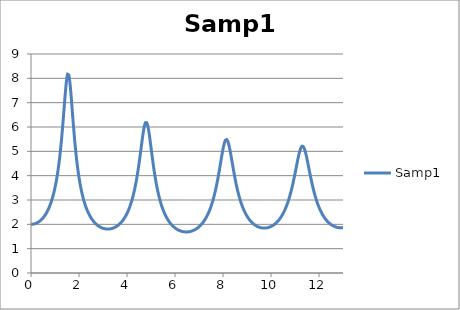
| Category | Samp1 |
|---|---|
| 0.0 | 2 |
| 0.0122 | 2 |
| 0.0244 | 2.001 |
| 0.0366 | 2.001 |
| 0.0488 | 2.002 |
| 0.061 | 2.003 |
| 0.0732 | 2.005 |
| 0.0854 | 2.007 |
| 0.0977 | 2.009 |
| 0.1099 | 2.011 |
| 0.1221 | 2.014 |
| 0.1343 | 2.017 |
| 0.1465 | 2.02 |
| 0.1587 | 2.024 |
| 0.1709 | 2.028 |
| 0.1831 | 2.032 |
| 0.1953 | 2.037 |
| 0.2075 | 2.042 |
| 0.2197 | 2.047 |
| 0.2319 | 2.052 |
| 0.2441 | 2.058 |
| 0.2563 | 2.064 |
| 0.2686 | 2.071 |
| 0.2808 | 2.077 |
| 0.293 | 2.084 |
| 0.3052 | 2.092 |
| 0.3174 | 2.1 |
| 0.3296 | 2.108 |
| 0.3418 | 2.116 |
| 0.354 | 2.125 |
| 0.3662 | 2.135 |
| 0.3784 | 2.144 |
| 0.3906 | 2.154 |
| 0.4028 | 2.165 |
| 0.415 | 2.176 |
| 0.4272 | 2.187 |
| 0.4395 | 2.199 |
| 0.4517 | 2.211 |
| 0.4639 | 2.224 |
| 0.4761 | 2.237 |
| 0.4883 | 2.25 |
| 0.5005 | 2.264 |
| 0.5127 | 2.279 |
| 0.5249 | 2.294 |
| 0.5371 | 2.309 |
| 0.5493 | 2.325 |
| 0.5615 | 2.342 |
| 0.5737 | 2.359 |
| 0.5859 | 2.377 |
| 0.5981 | 2.395 |
| 0.6104 | 2.414 |
| 0.6226 | 2.434 |
| 0.6348 | 2.454 |
| 0.647 | 2.475 |
| 0.6592 | 2.496 |
| 0.6714 | 2.519 |
| 0.6836 | 2.542 |
| 0.6958 | 2.565 |
| 0.708 | 2.59 |
| 0.7202 | 2.615 |
| 0.7324 | 2.642 |
| 0.7446 | 2.669 |
| 0.7568 | 2.697 |
| 0.769 | 2.726 |
| 0.7813 | 2.756 |
| 0.7935 | 2.787 |
| 0.8057 | 2.819 |
| 0.8179 | 2.852 |
| 0.8301 | 2.886 |
| 0.8423 | 2.921 |
| 0.8545 | 2.958 |
| 0.8667 | 2.996 |
| 0.8789 | 3.035 |
| 0.8911 | 3.076 |
| 0.9033 | 3.118 |
| 0.9155 | 3.161 |
| 0.9277 | 3.206 |
| 0.9399 | 3.253 |
| 0.9521 | 3.301 |
| 0.9644 | 3.351 |
| 0.9766 | 3.403 |
| 0.9888 | 3.457 |
| 1.001 | 3.513 |
| 1.0132 | 3.571 |
| 1.0254 | 3.631 |
| 1.0376 | 3.693 |
| 1.0498 | 3.758 |
| 1.062 | 3.825 |
| 1.0742 | 3.895 |
| 1.0864 | 3.968 |
| 1.0986 | 4.043 |
| 1.1108 | 4.122 |
| 1.123 | 4.203 |
| 1.1353 | 4.288 |
| 1.1475 | 4.376 |
| 1.1597 | 4.467 |
| 1.1719 | 4.562 |
| 1.1841 | 4.661 |
| 1.1963 | 4.764 |
| 1.2085 | 4.87 |
| 1.2207 | 4.981 |
| 1.2329 | 5.095 |
| 1.2451 | 5.214 |
| 1.2573 | 5.337 |
| 1.2695 | 5.464 |
| 1.2817 | 5.596 |
| 1.2939 | 5.732 |
| 1.3062 | 5.871 |
| 1.3184 | 6.014 |
| 1.3306 | 6.161 |
| 1.3428 | 6.311 |
| 1.355 | 6.463 |
| 1.3672 | 6.616 |
| 1.3794 | 6.771 |
| 1.3916 | 6.926 |
| 1.4038 | 7.079 |
| 1.416 | 7.229 |
| 1.4282 | 7.375 |
| 1.4404 | 7.515 |
| 1.4526 | 7.648 |
| 1.4648 | 7.77 |
| 1.4771 | 7.88 |
| 1.4893 | 7.977 |
| 1.5015 | 8.057 |
| 1.5137 | 8.12 |
| 1.5259 | 8.165 |
| 1.5381 | 8.189 |
| 1.5503 | 8.192 |
| 1.5625 | 8.175 |
| 1.5747 | 8.138 |
| 1.5869 | 8.081 |
| 1.5991 | 8.006 |
| 1.6113 | 7.915 |
| 1.6235 | 7.808 |
| 1.6357 | 7.688 |
| 1.6479 | 7.558 |
| 1.6602 | 7.418 |
| 1.6724 | 7.271 |
| 1.6846 | 7.12 |
| 1.6968 | 6.965 |
| 1.709 | 6.808 |
| 1.7212 | 6.65 |
| 1.7334 | 6.493 |
| 1.7456 | 6.337 |
| 1.7578 | 6.183 |
| 1.77 | 6.032 |
| 1.7822 | 5.885 |
| 1.7944 | 5.741 |
| 1.8066 | 5.601 |
| 1.8188 | 5.465 |
| 1.8311 | 5.334 |
| 1.8433 | 5.207 |
| 1.8555 | 5.084 |
| 1.8677 | 4.965 |
| 1.8799 | 4.851 |
| 1.8921 | 4.741 |
| 1.9043 | 4.635 |
| 1.9165 | 4.533 |
| 1.9287 | 4.434 |
| 1.9409 | 4.34 |
| 1.9531 | 4.249 |
| 1.9653 | 4.161 |
| 1.9775 | 4.077 |
| 1.9897 | 3.996 |
| 2.002 | 3.918 |
| 2.0142 | 3.843 |
| 2.0264 | 3.771 |
| 2.0386 | 3.701 |
| 2.0508 | 3.634 |
| 2.063 | 3.569 |
| 2.0752 | 3.507 |
| 2.0874 | 3.447 |
| 2.0996 | 3.389 |
| 2.1118 | 3.334 |
| 2.124 | 3.28 |
| 2.1362 | 3.228 |
| 2.1484 | 3.178 |
| 2.1606 | 3.13 |
| 2.1729 | 3.083 |
| 2.1851 | 3.038 |
| 2.1973 | 2.995 |
| 2.2095 | 2.953 |
| 2.2217 | 2.912 |
| 2.2339 | 2.873 |
| 2.2461 | 2.835 |
| 2.2583 | 2.798 |
| 2.2705 | 2.762 |
| 2.2827 | 2.728 |
| 2.2949 | 2.695 |
| 2.3071 | 2.662 |
| 2.3193 | 2.631 |
| 2.3315 | 2.601 |
| 2.3438 | 2.572 |
| 2.356 | 2.543 |
| 2.3682 | 2.516 |
| 2.3804 | 2.489 |
| 2.3926 | 2.464 |
| 2.4048 | 2.439 |
| 2.417 | 2.414 |
| 2.4292 | 2.391 |
| 2.4414 | 2.368 |
| 2.4536 | 2.346 |
| 2.4658 | 2.325 |
| 2.478 | 2.304 |
| 2.4902 | 2.284 |
| 2.5024 | 2.265 |
| 2.5146 | 2.246 |
| 2.5269 | 2.227 |
| 2.5391 | 2.21 |
| 2.5513 | 2.192 |
| 2.5635 | 2.176 |
| 2.5757 | 2.159 |
| 2.5879 | 2.144 |
| 2.6001 | 2.129 |
| 2.6123 | 2.114 |
| 2.6245 | 2.1 |
| 2.6367 | 2.086 |
| 2.6489 | 2.072 |
| 2.6611 | 2.059 |
| 2.6733 | 2.047 |
| 2.6855 | 2.035 |
| 2.6978 | 2.023 |
| 2.71 | 2.012 |
| 2.7222 | 2.001 |
| 2.7344 | 1.99 |
| 2.7466 | 1.98 |
| 2.7588 | 1.97 |
| 2.771 | 1.96 |
| 2.7832 | 1.951 |
| 2.7954 | 1.942 |
| 2.8076 | 1.934 |
| 2.8198 | 1.925 |
| 2.832 | 1.917 |
| 2.8442 | 1.91 |
| 2.8564 | 1.902 |
| 2.8687 | 1.895 |
| 2.8809 | 1.889 |
| 2.8931 | 1.882 |
| 2.9053 | 1.876 |
| 2.9175 | 1.87 |
| 2.9297 | 1.865 |
| 2.9419 | 1.859 |
| 2.9541 | 1.854 |
| 2.9663 | 1.849 |
| 2.9785 | 1.845 |
| 2.9907 | 1.841 |
| 3.0029 | 1.837 |
| 3.0151 | 1.833 |
| 3.0273 | 1.829 |
| 3.0396 | 1.826 |
| 3.0518 | 1.823 |
| 3.064 | 1.82 |
| 3.0762 | 1.818 |
| 3.0884 | 1.816 |
| 3.1006 | 1.814 |
| 3.1128 | 1.812 |
| 3.125 | 1.81 |
| 3.1372 | 1.809 |
| 3.1494 | 1.808 |
| 3.1616 | 1.807 |
| 3.1738 | 1.806 |
| 3.186 | 1.806 |
| 3.1982 | 1.806 |
| 3.2104 | 1.806 |
| 3.2227 | 1.806 |
| 3.2349 | 1.807 |
| 3.2471 | 1.808 |
| 3.2593 | 1.809 |
| 3.2715 | 1.81 |
| 3.2837 | 1.811 |
| 3.2959 | 1.813 |
| 3.3081 | 1.815 |
| 3.3203 | 1.817 |
| 3.3325 | 1.82 |
| 3.3447 | 1.823 |
| 3.3569 | 1.826 |
| 3.3691 | 1.829 |
| 3.3813 | 1.832 |
| 3.3936 | 1.836 |
| 3.4058 | 1.84 |
| 3.418 | 1.844 |
| 3.4302 | 1.849 |
| 3.4424 | 1.853 |
| 3.4546 | 1.859 |
| 3.4668 | 1.864 |
| 3.479 | 1.869 |
| 3.4912 | 1.875 |
| 3.5034 | 1.881 |
| 3.5156 | 1.888 |
| 3.5278 | 1.894 |
| 3.54 | 1.901 |
| 3.5522 | 1.909 |
| 3.5645 | 1.916 |
| 3.5767 | 1.924 |
| 3.5889 | 1.932 |
| 3.6011 | 1.941 |
| 3.6133 | 1.95 |
| 3.6255 | 1.959 |
| 3.6377 | 1.968 |
| 3.6499 | 1.978 |
| 3.6621 | 1.988 |
| 3.6743 | 1.999 |
| 3.6865 | 2.01 |
| 3.6987 | 2.021 |
| 3.7109 | 2.033 |
| 3.7231 | 2.045 |
| 3.7354 | 2.057 |
| 3.7476 | 2.07 |
| 3.7598 | 2.083 |
| 3.772 | 2.097 |
| 3.7842 | 2.111 |
| 3.7964 | 2.126 |
| 3.8086 | 2.141 |
| 3.8208 | 2.156 |
| 3.833 | 2.172 |
| 3.8452 | 2.189 |
| 3.8574 | 2.206 |
| 3.8696 | 2.224 |
| 3.8818 | 2.242 |
| 3.894 | 2.26 |
| 3.9063 | 2.28 |
| 3.9185 | 2.3 |
| 3.9307 | 2.32 |
| 3.9429 | 2.341 |
| 3.9551 | 2.363 |
| 3.9673 | 2.385 |
| 3.9795 | 2.408 |
| 3.9917 | 2.432 |
| 4.0039 | 2.457 |
| 4.0161 | 2.482 |
| 4.0283 | 2.508 |
| 4.0405 | 2.535 |
| 4.0527 | 2.563 |
| 4.0649 | 2.592 |
| 4.0771 | 2.621 |
| 4.0894 | 2.651 |
| 4.1016 | 2.683 |
| 4.1138 | 2.715 |
| 4.126 | 2.749 |
| 4.1382 | 2.783 |
| 4.1504 | 2.819 |
| 4.1626 | 2.855 |
| 4.1748 | 2.893 |
| 4.187 | 2.932 |
| 4.1992 | 2.973 |
| 4.2114 | 3.014 |
| 4.2236 | 3.057 |
| 4.2358 | 3.102 |
| 4.248 | 3.147 |
| 4.2603 | 3.195 |
| 4.2725 | 3.243 |
| 4.2847 | 3.294 |
| 4.2969 | 3.346 |
| 4.3091 | 3.399 |
| 4.3213 | 3.455 |
| 4.3335 | 3.512 |
| 4.3457 | 3.571 |
| 4.3579 | 3.632 |
| 4.3701 | 3.695 |
| 4.3823 | 3.76 |
| 4.3945 | 3.826 |
| 4.4067 | 3.895 |
| 4.4189 | 3.966 |
| 4.4312 | 4.039 |
| 4.4434 | 4.114 |
| 4.4556 | 4.191 |
| 4.4678 | 4.27 |
| 4.48 | 4.351 |
| 4.4922 | 4.434 |
| 4.5044 | 4.518 |
| 4.5166 | 4.605 |
| 4.5288 | 4.693 |
| 4.541 | 4.783 |
| 4.5532 | 4.873 |
| 4.5654 | 4.965 |
| 4.5776 | 5.057 |
| 4.5898 | 5.15 |
| 4.6021 | 5.242 |
| 4.6143 | 5.334 |
| 4.6265 | 5.425 |
| 4.6387 | 5.514 |
| 4.6509 | 5.601 |
| 4.6631 | 5.685 |
| 4.6753 | 5.765 |
| 4.6875 | 5.84 |
| 4.6997 | 5.911 |
| 4.7119 | 5.975 |
| 4.7241 | 6.032 |
| 4.7363 | 6.082 |
| 4.7485 | 6.124 |
| 4.7607 | 6.157 |
| 4.7729 | 6.18 |
| 4.7852 | 6.195 |
| 4.7974 | 6.199 |
| 4.8096 | 6.193 |
| 4.8218 | 6.178 |
| 4.834 | 6.153 |
| 4.8462 | 6.119 |
| 4.8584 | 6.075 |
| 4.8706 | 6.024 |
| 4.8828 | 5.965 |
| 4.895 | 5.9 |
| 4.9072 | 5.828 |
| 4.9194 | 5.751 |
| 4.9316 | 5.669 |
| 4.9438 | 5.584 |
| 4.9561 | 5.496 |
| 4.9683 | 5.405 |
| 4.9805 | 5.313 |
| 4.9927 | 5.22 |
| 5.0049 | 5.126 |
| 5.0171 | 5.032 |
| 5.0293 | 4.938 |
| 5.0415 | 4.845 |
| 5.0537 | 4.753 |
| 5.0659 | 4.662 |
| 5.0781 | 4.572 |
| 5.0903 | 4.485 |
| 5.1025 | 4.399 |
| 5.1147 | 4.314 |
| 5.127 | 4.232 |
| 5.1392 | 4.152 |
| 5.1514 | 4.074 |
| 5.1636 | 3.998 |
| 5.1758 | 3.924 |
| 5.188 | 3.853 |
| 5.2002 | 3.783 |
| 5.2124 | 3.715 |
| 5.2246 | 3.649 |
| 5.2368 | 3.586 |
| 5.249 | 3.524 |
| 5.2612 | 3.464 |
| 5.2734 | 3.406 |
| 5.2856 | 3.35 |
| 5.2979 | 3.296 |
| 5.3101 | 3.243 |
| 5.3223 | 3.192 |
| 5.3345 | 3.142 |
| 5.3467 | 3.094 |
| 5.3589 | 3.048 |
| 5.3711 | 3.003 |
| 5.3833 | 2.959 |
| 5.3955 | 2.917 |
| 5.4077 | 2.876 |
| 5.4199 | 2.837 |
| 5.4321 | 2.798 |
| 5.4443 | 2.761 |
| 5.4565 | 2.725 |
| 5.4688 | 2.69 |
| 5.481 | 2.656 |
| 5.4932 | 2.623 |
| 5.5054 | 2.591 |
| 5.5176 | 2.56 |
| 5.5298 | 2.53 |
| 5.542 | 2.501 |
| 5.5542 | 2.472 |
| 5.5664 | 2.445 |
| 5.5786 | 2.418 |
| 5.5908 | 2.393 |
| 5.603 | 2.367 |
| 5.6152 | 2.343 |
| 5.6274 | 2.319 |
| 5.6396 | 2.297 |
| 5.6519 | 2.274 |
| 5.6641 | 2.253 |
| 5.6763 | 2.232 |
| 5.6885 | 2.211 |
| 5.7007 | 2.191 |
| 5.7129 | 2.172 |
| 5.7251 | 2.154 |
| 5.7373 | 2.135 |
| 5.7495 | 2.118 |
| 5.7617 | 2.101 |
| 5.7739 | 2.084 |
| 5.7861 | 2.068 |
| 5.7983 | 2.052 |
| 5.8105 | 2.037 |
| 5.8228 | 2.022 |
| 5.835 | 2.008 |
| 5.8472 | 1.994 |
| 5.8594 | 1.981 |
| 5.8716 | 1.968 |
| 5.8838 | 1.955 |
| 5.896 | 1.943 |
| 5.9082 | 1.931 |
| 5.9204 | 1.919 |
| 5.9326 | 1.908 |
| 5.9448 | 1.897 |
| 5.957 | 1.887 |
| 5.9692 | 1.877 |
| 5.9814 | 1.867 |
| 5.9937 | 1.857 |
| 6.0059 | 1.848 |
| 6.0181 | 1.839 |
| 6.0303 | 1.831 |
| 6.0425 | 1.822 |
| 6.0547 | 1.814 |
| 6.0669 | 1.807 |
| 6.0791 | 1.799 |
| 6.0913 | 1.792 |
| 6.1035 | 1.785 |
| 6.1157 | 1.778 |
| 6.1279 | 1.772 |
| 6.1401 | 1.766 |
| 6.1523 | 1.76 |
| 6.1646 | 1.754 |
| 6.1768 | 1.749 |
| 6.189 | 1.744 |
| 6.2012 | 1.739 |
| 6.2134 | 1.734 |
| 6.2256 | 1.73 |
| 6.2378 | 1.726 |
| 6.25 | 1.722 |
| 6.2622 | 1.718 |
| 6.2744 | 1.714 |
| 6.2866 | 1.711 |
| 6.2988 | 1.708 |
| 6.311 | 1.705 |
| 6.3232 | 1.703 |
| 6.3354 | 1.7 |
| 6.3477 | 1.698 |
| 6.3599 | 1.696 |
| 6.3721 | 1.694 |
| 6.3843 | 1.693 |
| 6.3965 | 1.691 |
| 6.4087 | 1.69 |
| 6.4209 | 1.689 |
| 6.4331 | 1.688 |
| 6.4453 | 1.688 |
| 6.4575 | 1.688 |
| 6.4697 | 1.687 |
| 6.4819 | 1.687 |
| 6.4941 | 1.688 |
| 6.5063 | 1.688 |
| 6.5186 | 1.689 |
| 6.5308 | 1.69 |
| 6.543 | 1.691 |
| 6.5552 | 1.692 |
| 6.5674 | 1.694 |
| 6.5796 | 1.696 |
| 6.5918 | 1.698 |
| 6.604 | 1.7 |
| 6.6162 | 1.702 |
| 6.6284 | 1.705 |
| 6.6406 | 1.707 |
| 6.6528 | 1.71 |
| 6.665 | 1.714 |
| 6.6772 | 1.717 |
| 6.6895 | 1.721 |
| 6.7017 | 1.725 |
| 6.7139 | 1.729 |
| 6.7261 | 1.733 |
| 6.7383 | 1.738 |
| 6.7505 | 1.743 |
| 6.7627 | 1.748 |
| 6.7749 | 1.753 |
| 6.7871 | 1.759 |
| 6.7993 | 1.764 |
| 6.8115 | 1.77 |
| 6.8237 | 1.777 |
| 6.8359 | 1.783 |
| 6.8481 | 1.79 |
| 6.8604 | 1.797 |
| 6.8726 | 1.804 |
| 6.8848 | 1.812 |
| 6.897 | 1.82 |
| 6.9092 | 1.828 |
| 6.9214 | 1.836 |
| 6.9336 | 1.845 |
| 6.9458 | 1.854 |
| 6.958 | 1.864 |
| 6.9702 | 1.873 |
| 6.9824 | 1.883 |
| 6.9946 | 1.893 |
| 7.0068 | 1.904 |
| 7.019 | 1.915 |
| 7.0312 | 1.926 |
| 7.0435 | 1.938 |
| 7.0557 | 1.95 |
| 7.0679 | 1.962 |
| 7.0801 | 1.975 |
| 7.0923 | 1.988 |
| 7.1045 | 2.002 |
| 7.1167 | 2.016 |
| 7.1289 | 2.03 |
| 7.1411 | 2.045 |
| 7.1533 | 2.06 |
| 7.1655 | 2.076 |
| 7.1777 | 2.092 |
| 7.1899 | 2.108 |
| 7.2021 | 2.125 |
| 7.2144 | 2.143 |
| 7.2266 | 2.161 |
| 7.2388 | 2.18 |
| 7.251 | 2.199 |
| 7.2632 | 2.218 |
| 7.2754 | 2.239 |
| 7.2876 | 2.259 |
| 7.2998 | 2.281 |
| 7.312 | 2.303 |
| 7.3242 | 2.325 |
| 7.3364 | 2.349 |
| 7.3486 | 2.373 |
| 7.3608 | 2.397 |
| 7.373 | 2.423 |
| 7.3853 | 2.449 |
| 7.3975 | 2.476 |
| 7.4097 | 2.504 |
| 7.4219 | 2.532 |
| 7.4341 | 2.561 |
| 7.4463 | 2.591 |
| 7.4585 | 2.622 |
| 7.4707 | 2.654 |
| 7.4829 | 2.687 |
| 7.4951 | 2.721 |
| 7.5073 | 2.756 |
| 7.5195 | 2.792 |
| 7.5317 | 2.828 |
| 7.5439 | 2.866 |
| 7.5562 | 2.905 |
| 7.5684 | 2.946 |
| 7.5806 | 2.987 |
| 7.5928 | 3.029 |
| 7.605 | 3.073 |
| 7.6172 | 3.118 |
| 7.6294 | 3.164 |
| 7.6416 | 3.212 |
| 7.6538 | 3.261 |
| 7.666 | 3.311 |
| 7.6782 | 3.363 |
| 7.6904 | 3.416 |
| 7.7026 | 3.47 |
| 7.7148 | 3.526 |
| 7.7271 | 3.584 |
| 7.7393 | 3.642 |
| 7.7515 | 3.702 |
| 7.7637 | 3.764 |
| 7.7759 | 3.827 |
| 7.7881 | 3.891 |
| 7.8003 | 3.957 |
| 7.8125 | 4.024 |
| 7.8247 | 4.092 |
| 7.8369 | 4.161 |
| 7.8491 | 4.231 |
| 7.8613 | 4.302 |
| 7.8735 | 4.373 |
| 7.8857 | 4.445 |
| 7.8979 | 4.517 |
| 7.9102 | 4.59 |
| 7.9224 | 4.662 |
| 7.9346 | 4.733 |
| 7.9468 | 4.804 |
| 7.959 | 4.874 |
| 7.9712 | 4.941 |
| 7.9834 | 5.007 |
| 7.9956 | 5.071 |
| 8.0078 | 5.132 |
| 8.02 | 5.189 |
| 8.0322 | 5.242 |
| 8.0444 | 5.292 |
| 8.0566 | 5.336 |
| 8.0688 | 5.376 |
| 8.0811 | 5.41 |
| 8.0933 | 5.438 |
| 8.1055 | 5.46 |
| 8.1177 | 5.476 |
| 8.1299 | 5.485 |
| 8.1421 | 5.488 |
| 8.1543 | 5.484 |
| 8.1665 | 5.473 |
| 8.1787 | 5.456 |
| 8.1909 | 5.433 |
| 8.2031 | 5.403 |
| 8.2153 | 5.368 |
| 8.2275 | 5.328 |
| 8.2397 | 5.283 |
| 8.252 | 5.234 |
| 8.2642 | 5.18 |
| 8.2764 | 5.123 |
| 8.2886 | 5.063 |
| 8.3008 | 5 |
| 8.313 | 4.935 |
| 8.3252 | 4.868 |
| 8.3374 | 4.8 |
| 8.3496 | 4.731 |
| 8.3618 | 4.661 |
| 8.374 | 4.591 |
| 8.3862 | 4.52 |
| 8.3984 | 4.45 |
| 8.4106 | 4.38 |
| 8.4229 | 4.31 |
| 8.4351 | 4.241 |
| 8.4473 | 4.174 |
| 8.4595 | 4.107 |
| 8.4717 | 4.041 |
| 8.4839 | 3.976 |
| 8.4961 | 3.913 |
| 8.5083 | 3.85 |
| 8.5205 | 3.79 |
| 8.5327 | 3.73 |
| 8.5449 | 3.672 |
| 8.5571 | 3.615 |
| 8.5693 | 3.56 |
| 8.5815 | 3.506 |
| 8.5938 | 3.453 |
| 8.606 | 3.402 |
| 8.6182 | 3.352 |
| 8.6304 | 3.304 |
| 8.6426 | 3.257 |
| 8.6548 | 3.211 |
| 8.667 | 3.166 |
| 8.6792 | 3.123 |
| 8.6914 | 3.081 |
| 8.7036 | 3.04 |
| 8.7158 | 3 |
| 8.728 | 2.961 |
| 8.7402 | 2.924 |
| 8.7524 | 2.887 |
| 8.7646 | 2.852 |
| 8.7769 | 2.817 |
| 8.7891 | 2.784 |
| 8.8013 | 2.751 |
| 8.8135 | 2.72 |
| 8.8257 | 2.689 |
| 8.8379 | 2.66 |
| 8.8501 | 2.631 |
| 8.8623 | 2.602 |
| 8.8745 | 2.575 |
| 8.8867 | 2.549 |
| 8.8989 | 2.523 |
| 8.9111 | 2.498 |
| 8.9233 | 2.474 |
| 8.9355 | 2.45 |
| 8.9478 | 2.427 |
| 8.96 | 2.405 |
| 8.9722 | 2.383 |
| 8.9844 | 2.362 |
| 8.9966 | 2.342 |
| 9.0088 | 2.322 |
| 9.021 | 2.303 |
| 9.0332 | 2.285 |
| 9.0454 | 2.266 |
| 9.0576 | 2.249 |
| 9.0698 | 2.232 |
| 9.082 | 2.215 |
| 9.0942 | 2.199 |
| 9.1064 | 2.184 |
| 9.1187 | 2.169 |
| 9.1309 | 2.154 |
| 9.1431 | 2.14 |
| 9.1553 | 2.126 |
| 9.1675 | 2.113 |
| 9.1797 | 2.1 |
| 9.1919 | 2.087 |
| 9.2041 | 2.075 |
| 9.2163 | 2.063 |
| 9.2285 | 2.052 |
| 9.2407 | 2.041 |
| 9.2529 | 2.03 |
| 9.2651 | 2.02 |
| 9.2773 | 2.01 |
| 9.2896 | 2 |
| 9.3018 | 1.991 |
| 9.314 | 1.982 |
| 9.3262 | 1.974 |
| 9.3384 | 1.965 |
| 9.3506 | 1.958 |
| 9.3628 | 1.95 |
| 9.375 | 1.943 |
| 9.3872 | 1.935 |
| 9.3994 | 1.929 |
| 9.4116 | 1.922 |
| 9.4238 | 1.916 |
| 9.436 | 1.91 |
| 9.4482 | 1.905 |
| 9.4604 | 1.899 |
| 9.4727 | 1.894 |
| 9.4849 | 1.889 |
| 9.4971 | 1.885 |
| 9.5093 | 1.88 |
| 9.5215 | 1.876 |
| 9.5337 | 1.873 |
| 9.5459 | 1.869 |
| 9.5581 | 1.866 |
| 9.5703 | 1.863 |
| 9.5825 | 1.86 |
| 9.5947 | 1.858 |
| 9.6069 | 1.855 |
| 9.6191 | 1.853 |
| 9.6313 | 1.851 |
| 9.6436 | 1.85 |
| 9.6558 | 1.849 |
| 9.668 | 1.847 |
| 9.6802 | 1.847 |
| 9.6924 | 1.846 |
| 9.7046 | 1.846 |
| 9.7168 | 1.845 |
| 9.729 | 1.846 |
| 9.7412 | 1.846 |
| 9.7534 | 1.846 |
| 9.7656 | 1.847 |
| 9.7778 | 1.848 |
| 9.79 | 1.85 |
| 9.8022 | 1.851 |
| 9.8145 | 1.853 |
| 9.8267 | 1.855 |
| 9.8389 | 1.857 |
| 9.8511 | 1.86 |
| 9.8633 | 1.862 |
| 9.8755 | 1.865 |
| 9.8877 | 1.869 |
| 9.8999 | 1.872 |
| 9.9121 | 1.876 |
| 9.9243 | 1.88 |
| 9.9365 | 1.884 |
| 9.9487 | 1.888 |
| 9.9609 | 1.893 |
| 9.9731 | 1.898 |
| 9.9854 | 1.904 |
| 9.9976 | 1.909 |
| 10.0098 | 1.915 |
| 10.022 | 1.921 |
| 10.0342 | 1.927 |
| 10.0464 | 1.934 |
| 10.0586 | 1.941 |
| 10.0708 | 1.948 |
| 10.083 | 1.956 |
| 10.0952 | 1.963 |
| 10.1074 | 1.972 |
| 10.1196 | 1.98 |
| 10.1318 | 1.989 |
| 10.144 | 1.998 |
| 10.1563 | 2.007 |
| 10.1685 | 2.017 |
| 10.1807 | 2.027 |
| 10.1929 | 2.037 |
| 10.2051 | 2.048 |
| 10.2173 | 2.059 |
| 10.2295 | 2.071 |
| 10.2417 | 2.083 |
| 10.2539 | 2.095 |
| 10.2661 | 2.107 |
| 10.2783 | 2.12 |
| 10.2905 | 2.134 |
| 10.3027 | 2.148 |
| 10.3149 | 2.162 |
| 10.3271 | 2.177 |
| 10.3394 | 2.192 |
| 10.3516 | 2.207 |
| 10.3638 | 2.223 |
| 10.376 | 2.24 |
| 10.3882 | 2.257 |
| 10.4004 | 2.274 |
| 10.4126 | 2.292 |
| 10.4248 | 2.311 |
| 10.437 | 2.33 |
| 10.4492 | 2.349 |
| 10.4614 | 2.37 |
| 10.4736 | 2.39 |
| 10.4858 | 2.412 |
| 10.498 | 2.434 |
| 10.5103 | 2.456 |
| 10.5225 | 2.48 |
| 10.5347 | 2.503 |
| 10.5469 | 2.528 |
| 10.5591 | 2.553 |
| 10.5713 | 2.579 |
| 10.5835 | 2.606 |
| 10.5957 | 2.633 |
| 10.6079 | 2.662 |
| 10.6201 | 2.691 |
| 10.6323 | 2.72 |
| 10.6445 | 2.751 |
| 10.6567 | 2.782 |
| 10.6689 | 2.815 |
| 10.6812 | 2.848 |
| 10.6934 | 2.882 |
| 10.7056 | 2.917 |
| 10.7178 | 2.953 |
| 10.73 | 2.99 |
| 10.7422 | 3.029 |
| 10.7544 | 3.068 |
| 10.7666 | 3.108 |
| 10.7788 | 3.149 |
| 10.791 | 3.191 |
| 10.8032 | 3.234 |
| 10.8154 | 3.279 |
| 10.8276 | 3.324 |
| 10.8398 | 3.371 |
| 10.8521 | 3.419 |
| 10.8643 | 3.468 |
| 10.8765 | 3.518 |
| 10.8887 | 3.569 |
| 10.9009 | 3.621 |
| 10.9131 | 3.675 |
| 10.9253 | 3.729 |
| 10.9375 | 3.785 |
| 10.9497 | 3.841 |
| 10.9619 | 3.899 |
| 10.9741 | 3.957 |
| 10.9863 | 4.016 |
| 10.9985 | 4.076 |
| 11.0107 | 4.136 |
| 11.0229 | 4.197 |
| 11.0352 | 4.258 |
| 11.0474 | 4.32 |
| 11.0596 | 4.381 |
| 11.0718 | 4.442 |
| 11.084 | 4.503 |
| 11.0962 | 4.564 |
| 11.1084 | 4.623 |
| 11.1206 | 4.682 |
| 11.1328 | 4.739 |
| 11.145 | 4.794 |
| 11.1572 | 4.847 |
| 11.1694 | 4.898 |
| 11.1816 | 4.946 |
| 11.1938 | 4.991 |
| 11.2061 | 5.033 |
| 11.2183 | 5.072 |
| 11.2305 | 5.106 |
| 11.2427 | 5.136 |
| 11.2549 | 5.162 |
| 11.2671 | 5.182 |
| 11.2793 | 5.198 |
| 11.2915 | 5.209 |
| 11.3037 | 5.215 |
| 11.3159 | 5.215 |
| 11.3281 | 5.211 |
| 11.3403 | 5.201 |
| 11.3525 | 5.186 |
| 11.3647 | 5.166 |
| 11.377 | 5.141 |
| 11.3892 | 5.112 |
| 11.4014 | 5.078 |
| 11.4136 | 5.041 |
| 11.4258 | 4.999 |
| 11.438 | 4.955 |
| 11.4502 | 4.907 |
| 11.4624 | 4.857 |
| 11.4746 | 4.804 |
| 11.4868 | 4.749 |
| 11.499 | 4.693 |
| 11.5112 | 4.635 |
| 11.5234 | 4.576 |
| 11.5356 | 4.516 |
| 11.5479 | 4.455 |
| 11.5601 | 4.394 |
| 11.5723 | 4.333 |
| 11.5845 | 4.271 |
| 11.5967 | 4.21 |
| 11.6089 | 4.15 |
| 11.6211 | 4.089 |
| 11.6333 | 4.03 |
| 11.6455 | 3.971 |
| 11.6577 | 3.912 |
| 11.6699 | 3.855 |
| 11.6821 | 3.799 |
| 11.6943 | 3.743 |
| 11.7065 | 3.689 |
| 11.7188 | 3.635 |
| 11.731 | 3.583 |
| 11.7432 | 3.532 |
| 11.7554 | 3.482 |
| 11.7676 | 3.433 |
| 11.7798 | 3.385 |
| 11.792 | 3.338 |
| 11.8042 | 3.293 |
| 11.8164 | 3.248 |
| 11.8286 | 3.205 |
| 11.8408 | 3.163 |
| 11.853 | 3.121 |
| 11.8652 | 3.081 |
| 11.8774 | 3.042 |
| 11.8896 | 3.004 |
| 11.9019 | 2.967 |
| 11.9141 | 2.931 |
| 11.9263 | 2.896 |
| 11.9385 | 2.861 |
| 11.9507 | 2.828 |
| 11.9629 | 2.796 |
| 11.9751 | 2.764 |
| 11.9873 | 2.734 |
| 11.9995 | 2.704 |
| 12.0117 | 2.675 |
| 12.0239 | 2.646 |
| 12.0361 | 2.619 |
| 12.0483 | 2.592 |
| 12.0605 | 2.566 |
| 12.0728 | 2.541 |
| 12.085 | 2.516 |
| 12.0972 | 2.493 |
| 12.1094 | 2.469 |
| 12.1216 | 2.447 |
| 12.1338 | 2.425 |
| 12.146 | 2.403 |
| 12.1582 | 2.383 |
| 12.1704 | 2.362 |
| 12.1826 | 2.343 |
| 12.1948 | 2.324 |
| 12.207 | 2.305 |
| 12.2192 | 2.287 |
| 12.2314 | 2.27 |
| 12.2437 | 2.253 |
| 12.2559 | 2.236 |
| 12.2681 | 2.22 |
| 12.2803 | 2.205 |
| 12.2925 | 2.189 |
| 12.3047 | 2.175 |
| 12.3169 | 2.161 |
| 12.3291 | 2.147 |
| 12.3413 | 2.133 |
| 12.3535 | 2.12 |
| 12.3657 | 2.108 |
| 12.3779 | 2.095 |
| 12.3901 | 2.084 |
| 12.4023 | 2.072 |
| 12.4145 | 2.061 |
| 12.4268 | 2.05 |
| 12.439 | 2.04 |
| 12.4512 | 2.03 |
| 12.4634 | 2.02 |
| 12.4756 | 2.011 |
| 12.4878 | 2.002 |
| 12.5 | 1.993 |
| 12.5122 | 1.985 |
| 12.5244 | 1.976 |
| 12.5366 | 1.969 |
| 12.5488 | 1.961 |
| 12.561 | 1.954 |
| 12.5732 | 1.947 |
| 12.5854 | 1.94 |
| 12.5977 | 1.934 |
| 12.6099 | 1.928 |
| 12.6221 | 1.922 |
| 12.6343 | 1.917 |
| 12.6465 | 1.911 |
| 12.6587 | 1.906 |
| 12.6709 | 1.902 |
| 12.6831 | 1.897 |
| 12.6953 | 1.893 |
| 12.7075 | 1.889 |
| 12.7197 | 1.885 |
| 12.7319 | 1.882 |
| 12.7441 | 1.879 |
| 12.7563 | 1.876 |
| 12.7686 | 1.873 |
| 12.7808 | 1.87 |
| 12.793 | 1.868 |
| 12.8052 | 1.866 |
| 12.8174 | 1.864 |
| 12.8296 | 1.863 |
| 12.8418 | 1.862 |
| 12.854 | 1.861 |
| 12.8662 | 1.86 |
| 12.8784 | 1.859 |
| 12.8906 | 1.859 |
| 12.9028 | 1.859 |
| 12.915 | 1.859 |
| 12.9272 | 1.859 |
| 12.9395 | 1.86 |
| 12.9517 | 1.861 |
| 12.9639 | 1.862 |
| 12.9761 | 1.863 |
| 12.9883 | 1.864 |
| 13.0005 | 1.866 |
| 13.0127 | 1.868 |
| 13.0249 | 1.87 |
| 13.0371 | 1.873 |
| 13.0493 | 1.876 |
| 13.0615 | 1.879 |
| 13.0737 | 1.882 |
| 13.0859 | 1.885 |
| 13.0981 | 1.889 |
| 13.1104 | 1.893 |
| 13.1226 | 1.897 |
| 13.1348 | 1.902 |
| 13.147 | 1.906 |
| 13.1592 | 1.911 |
| 13.1714 | 1.917 |
| 13.1836 | 1.922 |
| 13.1958 | 1.928 |
| 13.208 | 1.934 |
| 13.2202 | 1.94 |
| 13.2324 | 1.947 |
| 13.2446 | 1.954 |
| 13.2568 | 1.961 |
| 13.269 | 1.968 |
| 13.2813 | 1.976 |
| 13.2935 | 1.984 |
| 13.3057 | 1.992 |
| 13.3179 | 2.001 |
| 13.3301 | 2.01 |
| 13.3423 | 2.019 |
| 13.3545 | 2.029 |
| 13.3667 | 2.039 |
| 13.3789 | 2.049 |
| 13.3911 | 2.06 |
| 13.4033 | 2.071 |
| 13.4155 | 2.082 |
| 13.4277 | 2.093 |
| 13.4399 | 2.105 |
| 13.4521 | 2.118 |
| 13.4644 | 2.131 |
| 13.4766 | 2.144 |
| 13.4888 | 2.157 |
| 13.501 | 2.171 |
| 13.5132 | 2.186 |
| 13.5254 | 2.2 |
| 13.5376 | 2.216 |
| 13.5498 | 2.231 |
| 13.562 | 2.247 |
| 13.5742 | 2.264 |
| 13.5864 | 2.281 |
| 13.5986 | 2.298 |
| 13.6108 | 2.316 |
| 13.623 | 2.335 |
| 13.6353 | 2.354 |
| 13.6475 | 2.373 |
| 13.6597 | 2.393 |
| 13.6719 | 2.413 |
| 13.6841 | 2.435 |
| 13.6963 | 2.456 |
| 13.7085 | 2.478 |
| 13.7207 | 2.501 |
| 13.7329 | 2.524 |
| 13.7451 | 2.548 |
| 13.7573 | 2.573 |
| 13.7695 | 2.598 |
| 13.7817 | 2.624 |
| 13.7939 | 2.65 |
| 13.8062 | 2.678 |
| 13.8184 | 2.705 |
| 13.8306 | 2.734 |
| 13.8428 | 2.763 |
| 13.855 | 2.793 |
| 13.8672 | 2.824 |
| 13.8794 | 2.855 |
| 13.8916 | 2.887 |
| 13.9038 | 2.919 |
| 13.916 | 2.953 |
| 13.9282 | 2.987 |
| 13.9404 | 3.022 |
| 13.9526 | 3.057 |
| 13.9648 | 3.094 |
| 13.9771 | 3.131 |
| 13.9893 | 3.168 |
| 14.0015 | 3.207 |
| 14.0137 | 3.246 |
| 14.0259 | 3.285 |
| 14.0381 | 3.326 |
| 14.0503 | 3.367 |
| 14.0625 | 3.408 |
| 14.0747 | 3.45 |
| 14.0869 | 3.492 |
| 14.0991 | 3.535 |
| 14.1113 | 3.578 |
| 14.1235 | 3.621 |
| 14.1357 | 3.664 |
| 14.1479 | 3.708 |
| 14.1602 | 3.751 |
| 14.1724 | 3.794 |
| 14.1846 | 3.837 |
| 14.1968 | 3.88 |
| 14.209 | 3.922 |
| 14.2212 | 3.963 |
| 14.2334 | 4.004 |
| 14.2456 | 4.043 |
| 14.2578 | 4.081 |
| 14.27 | 4.118 |
| 14.2822 | 4.154 |
| 14.2944 | 4.188 |
| 14.3066 | 4.219 |
| 14.3188 | 4.249 |
| 14.3311 | 4.277 |
| 14.3433 | 4.302 |
| 14.3555 | 4.324 |
| 14.3677 | 4.344 |
| 14.3799 | 4.361 |
| 14.3921 | 4.375 |
| 14.4043 | 4.385 |
| 14.4165 | 4.393 |
| 14.4287 | 4.397 |
| 14.4409 | 4.398 |
| 14.4531 | 4.396 |
| 14.4653 | 4.39 |
| 14.4775 | 4.381 |
| 14.4897 | 4.369 |
| 14.502 | 4.353 |
| 14.5142 | 4.335 |
| 14.5264 | 4.314 |
| 14.5386 | 4.289 |
| 14.5508 | 4.263 |
| 14.563 | 4.233 |
| 14.5752 | 4.202 |
| 14.5874 | 4.168 |
| 14.5996 | 4.133 |
| 14.6118 | 4.095 |
| 14.624 | 4.056 |
| 14.6362 | 4.016 |
| 14.6484 | 3.974 |
| 14.6606 | 3.932 |
| 14.6729 | 3.888 |
| 14.6851 | 3.844 |
| 14.6973 | 3.8 |
| 14.7095 | 3.755 |
| 14.7217 | 3.709 |
| 14.7339 | 3.664 |
| 14.7461 | 3.618 |
| 14.7583 | 3.573 |
| 14.7705 | 3.527 |
| 14.7827 | 3.482 |
| 14.7949 | 3.438 |
| 14.8071 | 3.393 |
| 14.8193 | 3.349 |
| 14.8315 | 3.306 |
| 14.8438 | 3.263 |
| 14.856 | 3.221 |
| 14.8682 | 3.179 |
| 14.8804 | 3.139 |
| 14.8926 | 3.098 |
| 14.9048 | 3.059 |
| 14.917 | 3.02 |
| 14.9292 | 2.982 |
| 14.9414 | 2.944 |
| 14.9536 | 2.908 |
| 14.9658 | 2.872 |
| 14.978 | 2.837 |
| 14.9902 | 2.802 |
| 15.0024 | 2.769 |
| 15.0146 | 2.736 |
| 15.0269 | 2.704 |
| 15.0391 | 2.672 |
| 15.0513 | 2.642 |
| 15.0635 | 2.612 |
| 15.0757 | 2.582 |
| 15.0879 | 2.554 |
| 15.1001 | 2.526 |
| 15.1123 | 2.498 |
| 15.1245 | 2.472 |
| 15.1367 | 2.446 |
| 15.1489 | 2.42 |
| 15.1611 | 2.396 |
| 15.1733 | 2.371 |
| 15.1855 | 2.348 |
| 15.1978 | 2.325 |
| 15.21 | 2.303 |
| 15.2222 | 2.281 |
| 15.2344 | 2.259 |
| 15.2466 | 2.239 |
| 15.2588 | 2.218 |
| 15.271 | 2.199 |
| 15.2832 | 2.179 |
| 15.2954 | 2.161 |
| 15.3076 | 2.142 |
| 15.3198 | 2.124 |
| 15.332 | 2.107 |
| 15.3442 | 2.09 |
| 15.3564 | 2.074 |
| 15.3687 | 2.058 |
| 15.3809 | 2.042 |
| 15.3931 | 2.027 |
| 15.4053 | 2.012 |
| 15.4175 | 1.997 |
| 15.4297 | 1.983 |
| 15.4419 | 1.97 |
| 15.4541 | 1.956 |
| 15.4663 | 1.943 |
| 15.4785 | 1.931 |
| 15.4907 | 1.918 |
| 15.5029 | 1.906 |
| 15.5151 | 1.895 |
| 15.5273 | 1.883 |
| 15.5396 | 1.872 |
| 15.5518 | 1.862 |
| 15.564 | 1.851 |
| 15.5762 | 1.841 |
| 15.5884 | 1.832 |
| 15.6006 | 1.822 |
| 15.6128 | 1.813 |
| 15.625 | 1.804 |
| 15.6372 | 1.795 |
| 15.6494 | 1.787 |
| 15.6616 | 1.779 |
| 15.6738 | 1.771 |
| 15.686 | 1.763 |
| 15.6982 | 1.756 |
| 15.7104 | 1.749 |
| 15.7227 | 1.742 |
| 15.7349 | 1.735 |
| 15.7471 | 1.729 |
| 15.7593 | 1.723 |
| 15.7715 | 1.717 |
| 15.7837 | 1.711 |
| 15.7959 | 1.705 |
| 15.8081 | 1.7 |
| 15.8203 | 1.695 |
| 15.8325 | 1.69 |
| 15.8447 | 1.686 |
| 15.8569 | 1.681 |
| 15.8691 | 1.677 |
| 15.8813 | 1.673 |
| 15.8936 | 1.669 |
| 15.9058 | 1.665 |
| 15.918 | 1.662 |
| 15.9302 | 1.659 |
| 15.9424 | 1.656 |
| 15.9546 | 1.653 |
| 15.9668 | 1.65 |
| 15.979 | 1.648 |
| 15.9912 | 1.646 |
| 16.0034 | 1.644 |
| 16.0156 | 1.642 |
| 16.0278 | 1.64 |
| 16.04 | 1.639 |
| 16.0522 | 1.637 |
| 16.0645 | 1.636 |
| 16.0767 | 1.635 |
| 16.0889 | 1.634 |
| 16.1011 | 1.634 |
| 16.1133 | 1.634 |
| 16.1255 | 1.633 |
| 16.1377 | 1.633 |
| 16.1499 | 1.634 |
| 16.1621 | 1.634 |
| 16.1743 | 1.634 |
| 16.1865 | 1.635 |
| 16.1987 | 1.636 |
| 16.2109 | 1.637 |
| 16.2231 | 1.638 |
| 16.2354 | 1.64 |
| 16.2476 | 1.642 |
| 16.2598 | 1.643 |
| 16.272 | 1.645 |
| 16.2842 | 1.648 |
| 16.2964 | 1.65 |
| 16.3086 | 1.653 |
| 16.3208 | 1.655 |
| 16.333 | 1.658 |
| 16.3452 | 1.662 |
| 16.3574 | 1.665 |
| 16.3696 | 1.668 |
| 16.3818 | 1.672 |
| 16.394 | 1.676 |
| 16.4063 | 1.68 |
| 16.4185 | 1.685 |
| 16.4307 | 1.689 |
| 16.4429 | 1.694 |
| 16.4551 | 1.699 |
| 16.4673 | 1.704 |
| 16.4795 | 1.71 |
| 16.4917 | 1.715 |
| 16.5039 | 1.721 |
| 16.5161 | 1.727 |
| 16.5283 | 1.734 |
| 16.5405 | 1.74 |
| 16.5527 | 1.747 |
| 16.5649 | 1.754 |
| 16.5771 | 1.761 |
| 16.5894 | 1.769 |
| 16.6016 | 1.776 |
| 16.6138 | 1.784 |
| 16.626 | 1.793 |
| 16.6382 | 1.801 |
| 16.6504 | 1.81 |
| 16.6626 | 1.819 |
| 16.6748 | 1.828 |
| 16.687 | 1.838 |
| 16.6992 | 1.848 |
| 16.7114 | 1.858 |
| 16.7236 | 1.868 |
| 16.7358 | 1.879 |
| 16.748 | 1.89 |
| 16.7603 | 1.901 |
| 16.7725 | 1.913 |
| 16.7847 | 1.925 |
| 16.7969 | 1.937 |
| 16.8091 | 1.95 |
| 16.8213 | 1.963 |
| 16.8335 | 1.976 |
| 16.8457 | 1.989 |
| 16.8579 | 2.003 |
| 16.8701 | 2.018 |
| 16.8823 | 2.032 |
| 16.8945 | 2.047 |
| 16.9067 | 2.063 |
| 16.9189 | 2.078 |
| 16.9312 | 2.095 |
| 16.9434 | 2.111 |
| 16.9556 | 2.128 |
| 16.9678 | 2.146 |
| 16.98 | 2.163 |
| 16.9922 | 2.182 |
| 17.0044 | 2.2 |
| 17.0166 | 2.219 |
| 17.0288 | 2.239 |
| 17.041 | 2.259 |
| 17.0532 | 2.279 |
| 17.0654 | 2.3 |
| 17.0776 | 2.321 |
| 17.0898 | 2.343 |
| 17.1021 | 2.366 |
| 17.1143 | 2.388 |
| 17.1265 | 2.412 |
| 17.1387 | 2.435 |
| 17.1509 | 2.46 |
| 17.1631 | 2.484 |
| 17.1753 | 2.51 |
| 17.1875 | 2.535 |
| 17.1997 | 2.561 |
| 17.2119 | 2.588 |
| 17.2241 | 2.615 |
| 17.2363 | 2.643 |
| 17.2485 | 2.671 |
| 17.2607 | 2.7 |
| 17.2729 | 2.729 |
| 17.2852 | 2.758 |
| 17.2974 | 2.788 |
| 17.3096 | 2.819 |
| 17.3218 | 2.849 |
| 17.334 | 2.88 |
| 17.3462 | 2.912 |
| 17.3584 | 2.944 |
| 17.3706 | 2.976 |
| 17.3828 | 3.008 |
| 17.395 | 3.04 |
| 17.4072 | 3.073 |
| 17.4194 | 3.106 |
| 17.4316 | 3.138 |
| 17.4438 | 3.171 |
| 17.4561 | 3.204 |
| 17.4683 | 3.236 |
| 17.4805 | 3.268 |
| 17.4927 | 3.3 |
| 17.5049 | 3.332 |
| 17.5171 | 3.363 |
| 17.5293 | 3.393 |
| 17.5415 | 3.423 |
| 17.5537 | 3.452 |
| 17.5659 | 3.48 |
| 17.5781 | 3.508 |
| 17.5903 | 3.534 |
| 17.6025 | 3.559 |
| 17.6147 | 3.582 |
| 17.627 | 3.605 |
| 17.6392 | 3.625 |
| 17.6514 | 3.644 |
| 17.6636 | 3.662 |
| 17.6758 | 3.677 |
| 17.688 | 3.691 |
| 17.7002 | 3.703 |
| 17.7124 | 3.712 |
| 17.7246 | 3.72 |
| 17.7368 | 3.726 |
| 17.749 | 3.729 |
| 17.7612 | 3.73 |
| 17.7734 | 3.729 |
| 17.7856 | 3.726 |
| 17.7979 | 3.721 |
| 17.8101 | 3.714 |
| 17.8223 | 3.704 |
| 17.8345 | 3.693 |
| 17.8467 | 3.679 |
| 17.8589 | 3.664 |
| 17.8711 | 3.647 |
| 17.8833 | 3.628 |
| 17.8955 | 3.607 |
| 17.9077 | 3.585 |
| 17.9199 | 3.562 |
| 17.9321 | 3.537 |
| 17.9443 | 3.511 |
| 17.9565 | 3.484 |
| 17.9688 | 3.456 |
| 17.981 | 3.427 |
| 17.9932 | 3.397 |
| 18.0054 | 3.367 |
| 18.0176 | 3.336 |
| 18.0298 | 3.304 |
| 18.042 | 3.272 |
| 18.0542 | 3.24 |
| 18.0664 | 3.207 |
| 18.0786 | 3.175 |
| 18.0908 | 3.142 |
| 18.103 | 3.109 |
| 18.1152 | 3.077 |
| 18.1274 | 3.044 |
| 18.1396 | 3.011 |
| 18.1519 | 2.979 |
| 18.1641 | 2.947 |
| 18.1763 | 2.915 |
| 18.1885 | 2.884 |
| 18.2007 | 2.853 |
| 18.2129 | 2.822 |
| 18.2251 | 2.791 |
| 18.2373 | 2.761 |
| 18.2495 | 2.732 |
| 18.2617 | 2.703 |
| 18.2739 | 2.674 |
| 18.2861 | 2.646 |
| 18.2983 | 2.618 |
| 18.3105 | 2.591 |
| 18.3228 | 2.564 |
| 18.335 | 2.538 |
| 18.3472 | 2.512 |
| 18.3594 | 2.486 |
| 18.3716 | 2.462 |
| 18.3838 | 2.437 |
| 18.396 | 2.413 |
| 18.4082 | 2.39 |
| 18.4204 | 2.367 |
| 18.4326 | 2.345 |
| 18.4448 | 2.323 |
| 18.457 | 2.301 |
| 18.4692 | 2.28 |
| 18.4814 | 2.26 |
| 18.4937 | 2.24 |
| 18.5059 | 2.22 |
| 18.5181 | 2.201 |
| 18.5303 | 2.182 |
| 18.5425 | 2.164 |
| 18.5547 | 2.146 |
| 18.5669 | 2.129 |
| 18.5791 | 2.112 |
| 18.5913 | 2.095 |
| 18.6035 | 2.079 |
| 18.6157 | 2.063 |
| 18.6279 | 2.047 |
| 18.6401 | 2.032 |
| 18.6523 | 2.017 |
| 18.6646 | 2.003 |
| 18.6768 | 1.989 |
| 18.689 | 1.975 |
| 18.7012 | 1.962 |
| 18.7134 | 1.949 |
| 18.7256 | 1.936 |
| 18.7378 | 1.924 |
| 18.75 | 1.912 |
| 18.7622 | 1.9 |
| 18.7744 | 1.889 |
| 18.7866 | 1.878 |
| 18.7988 | 1.867 |
| 18.811 | 1.856 |
| 18.8232 | 1.846 |
| 18.8354 | 1.836 |
| 18.8477 | 1.827 |
| 18.8599 | 1.817 |
| 18.8721 | 1.808 |
| 18.8843 | 1.799 |
| 18.8965 | 1.791 |
| 18.9087 | 1.782 |
| 18.9209 | 1.774 |
| 18.9331 | 1.766 |
| 18.9453 | 1.759 |
| 18.9575 | 1.751 |
| 18.9697 | 1.744 |
| 18.9819 | 1.737 |
| 18.9941 | 1.731 |
| 19.0063 | 1.724 |
| 19.0186 | 1.718 |
| 19.0308 | 1.712 |
| 19.043 | 1.706 |
| 19.0552 | 1.701 |
| 19.0674 | 1.695 |
| 19.0796 | 1.69 |
| 19.0918 | 1.685 |
| 19.104 | 1.681 |
| 19.1162 | 1.676 |
| 19.1284 | 1.672 |
| 19.1406 | 1.668 |
| 19.1528 | 1.664 |
| 19.165 | 1.66 |
| 19.1772 | 1.657 |
| 19.1895 | 1.653 |
| 19.2017 | 1.65 |
| 19.2139 | 1.647 |
| 19.2261 | 1.645 |
| 19.2383 | 1.642 |
| 19.2505 | 1.64 |
| 19.2627 | 1.637 |
| 19.2749 | 1.635 |
| 19.2871 | 1.634 |
| 19.2993 | 1.632 |
| 19.3115 | 1.631 |
| 19.3237 | 1.629 |
| 19.3359 | 1.628 |
| 19.3481 | 1.627 |
| 19.3604 | 1.626 |
| 19.3726 | 1.626 |
| 19.3848 | 1.626 |
| 19.397 | 1.625 |
| 19.4092 | 1.625 |
| 19.4214 | 1.625 |
| 19.4336 | 1.626 |
| 19.4458 | 1.626 |
| 19.458 | 1.627 |
| 19.4702 | 1.628 |
| 19.4824 | 1.629 |
| 19.4946 | 1.63 |
| 19.5068 | 1.631 |
| 19.519 | 1.633 |
| 19.5313 | 1.635 |
| 19.5435 | 1.637 |
| 19.5557 | 1.639 |
| 19.5679 | 1.641 |
| 19.5801 | 1.644 |
| 19.5923 | 1.646 |
| 19.6045 | 1.649 |
| 19.6167 | 1.652 |
| 19.6289 | 1.655 |
| 19.6411 | 1.659 |
| 19.6533 | 1.662 |
| 19.6655 | 1.666 |
| 19.6777 | 1.67 |
| 19.6899 | 1.674 |
| 19.7021 | 1.679 |
| 19.7144 | 1.683 |
| 19.7266 | 1.688 |
| 19.7388 | 1.693 |
| 19.751 | 1.698 |
| 19.7632 | 1.704 |
| 19.7754 | 1.709 |
| 19.7876 | 1.715 |
| 19.7998 | 1.721 |
| 19.812 | 1.728 |
| 19.8242 | 1.734 |
| 19.8364 | 1.741 |
| 19.8486 | 1.748 |
| 19.8608 | 1.755 |
| 19.873 | 1.762 |
| 19.8853 | 1.77 |
| 19.8975 | 1.778 |
| 19.9097 | 1.786 |
| 19.9219 | 1.794 |
| 19.9341 | 1.803 |
| 19.9463 | 1.812 |
| 19.9585 | 1.821 |
| 19.9707 | 1.83 |
| 19.9829 | 1.84 |
| 19.9951 | 1.85 |
| 20.0073 | 1.86 |
| 20.0195 | 1.87 |
| 20.0317 | 1.881 |
| 20.0439 | 1.892 |
| 20.0562 | 1.903 |
| 20.0684 | 1.915 |
| 20.0806 | 1.927 |
| 20.0928 | 1.939 |
| 20.105 | 1.952 |
| 20.1172 | 1.964 |
| 20.1294 | 1.978 |
| 20.1416 | 1.991 |
| 20.1538 | 2.005 |
| 20.166 | 2.019 |
| 20.1782 | 2.034 |
| 20.1904 | 2.048 |
| 20.2026 | 2.064 |
| 20.2148 | 2.079 |
| 20.2271 | 2.095 |
| 20.2393 | 2.111 |
| 20.2515 | 2.128 |
| 20.2637 | 2.145 |
| 20.2759 | 2.162 |
| 20.2881 | 2.18 |
| 20.3003 | 2.198 |
| 20.3125 | 2.217 |
| 20.3247 | 2.236 |
| 20.3369 | 2.255 |
| 20.3491 | 2.275 |
| 20.3613 | 2.295 |
| 20.3735 | 2.316 |
| 20.3857 | 2.337 |
| 20.3979 | 2.358 |
| 20.4102 | 2.38 |
| 20.4224 | 2.402 |
| 20.4346 | 2.425 |
| 20.4468 | 2.448 |
| 20.459 | 2.472 |
| 20.4712 | 2.496 |
| 20.4834 | 2.52 |
| 20.4956 | 2.545 |
| 20.5078 | 2.57 |
| 20.52 | 2.596 |
| 20.5322 | 2.622 |
| 20.5444 | 2.648 |
| 20.5566 | 2.675 |
| 20.5688 | 2.702 |
| 20.5811 | 2.73 |
| 20.5933 | 2.758 |
| 20.6055 | 2.786 |
| 20.6177 | 2.814 |
| 20.6299 | 2.843 |
| 20.6421 | 2.872 |
| 20.6543 | 2.901 |
| 20.6665 | 2.931 |
| 20.6787 | 2.96 |
| 20.6909 | 2.99 |
| 20.7031 | 3.019 |
| 20.7153 | 3.049 |
| 20.7275 | 3.078 |
| 20.7397 | 3.108 |
| 20.752 | 3.137 |
| 20.7642 | 3.166 |
| 20.7764 | 3.195 |
| 20.7886 | 3.223 |
| 20.8008 | 3.251 |
| 20.813 | 3.279 |
| 20.8252 | 3.306 |
| 20.8374 | 3.332 |
| 20.8496 | 3.358 |
| 20.8618 | 3.383 |
| 20.874 | 3.406 |
| 20.8862 | 3.429 |
| 20.8984 | 3.451 |
| 20.9106 | 3.472 |
| 20.9229 | 3.491 |
| 20.9351 | 3.509 |
| 20.9473 | 3.526 |
| 20.9595 | 3.541 |
| 20.9717 | 3.555 |
| 20.9839 | 3.567 |
| 20.9961 | 3.578 |
| 21.0083 | 3.587 |
| 21.0205 | 3.594 |
| 21.0327 | 3.599 |
| 21.0449 | 3.603 |
| 21.0571 | 3.605 |
| 21.0693 | 3.605 |
| 21.0815 | 3.603 |
| 21.0938 | 3.599 |
| 21.106 | 3.594 |
| 21.1182 | 3.587 |
| 21.1304 | 3.578 |
| 21.1426 | 3.567 |
| 21.1548 | 3.555 |
| 21.167 | 3.542 |
| 21.1792 | 3.527 |
| 21.1914 | 3.51 |
| 21.2036 | 3.493 |
| 21.2158 | 3.474 |
| 21.228 | 3.453 |
| 21.2402 | 3.432 |
| 21.2524 | 3.41 |
| 21.2646 | 3.387 |
| 21.2769 | 3.363 |
| 21.2891 | 3.338 |
| 21.3013 | 3.312 |
| 21.3135 | 3.286 |
| 21.3257 | 3.26 |
| 21.3379 | 3.233 |
| 21.3501 | 3.205 |
| 21.3623 | 3.178 |
| 21.3745 | 3.15 |
| 21.3867 | 3.122 |
| 21.3989 | 3.093 |
| 21.4111 | 3.065 |
| 21.4233 | 3.037 |
| 21.4355 | 3.008 |
| 21.4478 | 2.98 |
| 21.46 | 2.952 |
| 21.4722 | 2.924 |
| 21.4844 | 2.896 |
| 21.4966 | 2.869 |
| 21.5088 | 2.841 |
| 21.521 | 2.814 |
| 21.5332 | 2.788 |
| 21.5454 | 2.761 |
| 21.5576 | 2.735 |
| 21.5698 | 2.709 |
| 21.582 | 2.684 |
| 21.5942 | 2.659 |
| 21.6064 | 2.634 |
| 21.6187 | 2.61 |
| 21.6309 | 2.586 |
| 21.6431 | 2.562 |
| 21.6553 | 2.539 |
| 21.6675 | 2.516 |
| 21.6797 | 2.494 |
| 21.6919 | 2.472 |
| 21.7041 | 2.451 |
| 21.7163 | 2.43 |
| 21.7285 | 2.409 |
| 21.7407 | 2.389 |
| 21.7529 | 2.369 |
| 21.7651 | 2.35 |
| 21.7773 | 2.331 |
| 21.7896 | 2.312 |
| 21.8018 | 2.294 |
| 21.814 | 2.276 |
| 21.8262 | 2.259 |
| 21.8384 | 2.242 |
| 21.8506 | 2.225 |
| 21.8628 | 2.209 |
| 21.875 | 2.193 |
| 21.8872 | 2.178 |
| 21.8994 | 2.163 |
| 21.9116 | 2.148 |
| 21.9238 | 2.133 |
| 21.936 | 2.119 |
| 21.9482 | 2.106 |
| 21.9604 | 2.092 |
| 21.9727 | 2.079 |
| 21.9849 | 2.066 |
| 21.9971 | 2.054 |
| 22.0093 | 2.042 |
| 22.0215 | 2.03 |
| 22.0337 | 2.019 |
| 22.0459 | 2.008 |
| 22.0581 | 1.997 |
| 22.0703 | 1.986 |
| 22.0825 | 1.976 |
| 22.0947 | 1.966 |
| 22.1069 | 1.956 |
| 22.1191 | 1.947 |
| 22.1313 | 1.938 |
| 22.1436 | 1.929 |
| 22.1558 | 1.92 |
| 22.168 | 1.912 |
| 22.1802 | 1.904 |
| 22.1924 | 1.896 |
| 22.2046 | 1.889 |
| 22.2168 | 1.881 |
| 22.229 | 1.874 |
| 22.2412 | 1.868 |
| 22.2534 | 1.861 |
| 22.2656 | 1.855 |
| 22.2778 | 1.849 |
| 22.29 | 1.843 |
| 22.3022 | 1.837 |
| 22.3145 | 1.832 |
| 22.3267 | 1.827 |
| 22.3389 | 1.822 |
| 22.3511 | 1.817 |
| 22.3633 | 1.813 |
| 22.3755 | 1.809 |
| 22.3877 | 1.805 |
| 22.3999 | 1.801 |
| 22.4121 | 1.797 |
| 22.4243 | 1.794 |
| 22.4365 | 1.791 |
| 22.4487 | 1.788 |
| 22.4609 | 1.785 |
| 22.4731 | 1.782 |
| 22.4854 | 1.78 |
| 22.4976 | 1.778 |
| 22.5098 | 1.776 |
| 22.522 | 1.774 |
| 22.5342 | 1.773 |
| 22.5464 | 1.771 |
| 22.5586 | 1.77 |
| 22.5708 | 1.769 |
| 22.583 | 1.768 |
| 22.5952 | 1.768 |
| 22.6074 | 1.767 |
| 22.6196 | 1.767 |
| 22.6318 | 1.767 |
| 22.644 | 1.768 |
| 22.6563 | 1.768 |
| 22.6685 | 1.769 |
| 22.6807 | 1.77 |
| 22.6929 | 1.771 |
| 22.7051 | 1.772 |
| 22.7173 | 1.773 |
| 22.7295 | 1.775 |
| 22.7417 | 1.777 |
| 22.7539 | 1.779 |
| 22.7661 | 1.781 |
| 22.7783 | 1.784 |
| 22.7905 | 1.786 |
| 22.8027 | 1.789 |
| 22.8149 | 1.792 |
| 22.8271 | 1.795 |
| 22.8394 | 1.799 |
| 22.8516 | 1.803 |
| 22.8638 | 1.806 |
| 22.876 | 1.811 |
| 22.8882 | 1.815 |
| 22.9004 | 1.819 |
| 22.9126 | 1.824 |
| 22.9248 | 1.829 |
| 22.937 | 1.834 |
| 22.9492 | 1.84 |
| 22.9614 | 1.845 |
| 22.9736 | 1.851 |
| 22.9858 | 1.857 |
| 22.998 | 1.864 |
| 23.0103 | 1.87 |
| 23.0225 | 1.877 |
| 23.0347 | 1.884 |
| 23.0469 | 1.891 |
| 23.0591 | 1.899 |
| 23.0713 | 1.907 |
| 23.0835 | 1.915 |
| 23.0957 | 1.923 |
| 23.1079 | 1.932 |
| 23.1201 | 1.94 |
| 23.1323 | 1.949 |
| 23.1445 | 1.959 |
| 23.1567 | 1.968 |
| 23.1689 | 1.978 |
| 23.1812 | 1.988 |
| 23.1934 | 1.999 |
| 23.2056 | 2.009 |
| 23.2178 | 2.02 |
| 23.23 | 2.032 |
| 23.2422 | 2.043 |
| 23.2544 | 2.055 |
| 23.2666 | 2.067 |
| 23.2788 | 2.08 |
| 23.291 | 2.092 |
| 23.3032 | 2.106 |
| 23.3154 | 2.119 |
| 23.3276 | 2.133 |
| 23.3398 | 2.147 |
| 23.3521 | 2.161 |
| 23.3643 | 2.176 |
| 23.3765 | 2.191 |
| 23.3887 | 2.206 |
| 23.4009 | 2.222 |
| 23.4131 | 2.238 |
| 23.4253 | 2.254 |
| 23.4375 | 2.271 |
| 23.4497 | 2.288 |
| 23.4619 | 2.305 |
| 23.4741 | 2.323 |
| 23.4863 | 2.341 |
| 23.4985 | 2.359 |
| 23.5107 | 2.378 |
| 23.5229 | 2.397 |
| 23.5352 | 2.417 |
| 23.5474 | 2.437 |
| 23.5596 | 2.457 |
| 23.5718 | 2.477 |
| 23.584 | 2.498 |
| 23.5962 | 2.519 |
| 23.6084 | 2.541 |
| 23.6206 | 2.562 |
| 23.6328 | 2.584 |
| 23.645 | 2.607 |
| 23.6572 | 2.629 |
| 23.6694 | 2.652 |
| 23.6816 | 2.675 |
| 23.6938 | 2.699 |
| 23.7061 | 2.722 |
| 23.7183 | 2.746 |
| 23.7305 | 2.77 |
| 23.7427 | 2.794 |
| 23.7549 | 2.818 |
| 23.7671 | 2.843 |
| 23.7793 | 2.867 |
| 23.7915 | 2.891 |
| 23.8037 | 2.916 |
| 23.8159 | 2.94 |
| 23.8281 | 2.965 |
| 23.8403 | 2.989 |
| 23.8525 | 3.013 |
| 23.8647 | 3.036 |
| 23.877 | 3.06 |
| 23.8892 | 3.083 |
| 23.9014 | 3.106 |
| 23.9136 | 3.128 |
| 23.9258 | 3.15 |
| 23.938 | 3.172 |
| 23.9502 | 3.192 |
| 23.9624 | 3.212 |
| 23.9746 | 3.232 |
| 23.9868 | 3.25 |
| 23.999 | 3.268 |
| 24.0112 | 3.285 |
| 24.0234 | 3.3 |
| 24.0356 | 3.315 |
| 24.0479 | 3.329 |
| 24.0601 | 3.341 |
| 24.0723 | 3.352 |
| 24.0845 | 3.362 |
| 24.0967 | 3.371 |
| 24.1089 | 3.378 |
| 24.1211 | 3.384 |
| 24.1333 | 3.389 |
| 24.1455 | 3.392 |
| 24.1577 | 3.394 |
| 24.1699 | 3.394 |
| 24.1821 | 3.393 |
| 24.1943 | 3.39 |
| 24.2065 | 3.386 |
| 24.2188 | 3.381 |
| 24.231 | 3.374 |
| 24.2432 | 3.366 |
| 24.2554 | 3.356 |
| 24.2676 | 3.345 |
| 24.2798 | 3.333 |
| 24.292 | 3.32 |
| 24.3042 | 3.305 |
| 24.3164 | 3.289 |
| 24.3286 | 3.273 |
| 24.3408 | 3.255 |
| 24.353 | 3.236 |
| 24.3652 | 3.217 |
| 24.3774 | 3.196 |
| 24.3896 | 3.175 |
| 24.4019 | 3.154 |
| 24.4141 | 3.131 |
| 24.4263 | 3.108 |
| 24.4385 | 3.085 |
| 24.4507 | 3.061 |
| 24.4629 | 3.037 |
| 24.4751 | 3.013 |
| 24.4873 | 2.988 |
| 24.4995 | 2.963 |
| 24.5117 | 2.938 |
| 24.5239 | 2.912 |
| 24.5361 | 2.887 |
| 24.5483 | 2.861 |
| 24.5605 | 2.836 |
| 24.5728 | 2.811 |
| 24.585 | 2.785 |
| 24.5972 | 2.76 |
| 24.6094 | 2.735 |
| 24.6216 | 2.71 |
| 24.6338 | 2.685 |
| 24.646 | 2.661 |
| 24.6582 | 2.637 |
| 24.6704 | 2.612 |
| 24.6826 | 2.589 |
| 24.6948 | 2.565 |
| 24.707 | 2.542 |
| 24.7192 | 2.519 |
| 24.7314 | 2.496 |
| 24.7437 | 2.474 |
| 24.7559 | 2.452 |
| 24.7681 | 2.43 |
| 24.7803 | 2.409 |
| 24.7925 | 2.388 |
| 24.8047 | 2.367 |
| 24.8169 | 2.347 |
| 24.8291 | 2.327 |
| 24.8413 | 2.307 |
| 24.8535 | 2.288 |
| 24.8657 | 2.269 |
| 24.8779 | 2.25 |
| 24.8901 | 2.232 |
| 24.9023 | 2.214 |
| 24.9146 | 2.197 |
| 24.9268 | 2.18 |
| 24.939 | 2.163 |
| 24.9512 | 2.146 |
| 24.9634 | 2.13 |
| 24.9756 | 2.114 |
| 24.9878 | 2.099 |
| 25.0 | 2.084 |
| 25.0122 | 2.069 |
| 25.0244 | 2.054 |
| 25.0366 | 2.04 |
| 25.0488 | 2.026 |
| 25.061 | 2.013 |
| 25.0732 | 2 |
| 25.0854 | 1.987 |
| 25.0977 | 1.974 |
| 25.1099 | 1.962 |
| 25.1221 | 1.95 |
| 25.1343 | 1.938 |
| 25.1465 | 1.926 |
| 25.1587 | 1.915 |
| 25.1709 | 1.904 |
| 25.1831 | 1.893 |
| 25.1953 | 1.883 |
| 25.2075 | 1.873 |
| 25.2197 | 1.863 |
| 25.2319 | 1.853 |
| 25.2441 | 1.844 |
| 25.2563 | 1.835 |
| 25.2686 | 1.826 |
| 25.2808 | 1.817 |
| 25.293 | 1.809 |
| 25.3052 | 1.801 |
| 25.3174 | 1.793 |
| 25.3296 | 1.785 |
| 25.3418 | 1.778 |
| 25.354 | 1.77 |
| 25.3662 | 1.763 |
| 25.3784 | 1.757 |
| 25.3906 | 1.75 |
| 25.4028 | 1.744 |
| 25.415 | 1.737 |
| 25.4272 | 1.732 |
| 25.4395 | 1.726 |
| 25.4517 | 1.72 |
| 25.4639 | 1.715 |
| 25.4761 | 1.71 |
| 25.4883 | 1.705 |
| 25.5005 | 1.7 |
| 25.5127 | 1.696 |
| 25.5249 | 1.691 |
| 25.5371 | 1.687 |
| 25.5493 | 1.683 |
| 25.5615 | 1.679 |
| 25.5737 | 1.676 |
| 25.5859 | 1.672 |
| 25.5981 | 1.669 |
| 25.6103 | 1.666 |
| 25.6226 | 1.663 |
| 25.6348 | 1.66 |
| 25.647 | 1.658 |
| 25.6592 | 1.656 |
| 25.6714 | 1.653 |
| 25.6836 | 1.651 |
| 25.6958 | 1.65 |
| 25.708 | 1.648 |
| 25.7202 | 1.647 |
| 25.7324 | 1.645 |
| 25.7446 | 1.644 |
| 25.7568 | 1.643 |
| 25.769 | 1.642 |
| 25.7813 | 1.642 |
| 25.7935 | 1.641 |
| 25.8057 | 1.641 |
| 25.8179 | 1.641 |
| 25.8301 | 1.641 |
| 25.8423 | 1.641 |
| 25.8545 | 1.642 |
| 25.8667 | 1.642 |
| 25.8789 | 1.643 |
| 25.8911 | 1.644 |
| 25.9033 | 1.645 |
| 25.9155 | 1.646 |
| 25.9277 | 1.648 |
| 25.9399 | 1.649 |
| 25.9521 | 1.651 |
| 25.9644 | 1.653 |
| 25.9766 | 1.655 |
| 25.9888 | 1.658 |
| 26.001 | 1.66 |
| 26.0132 | 1.663 |
| 26.0254 | 1.666 |
| 26.0376 | 1.669 |
| 26.0498 | 1.672 |
| 26.062 | 1.675 |
| 26.0742 | 1.679 |
| 26.0864 | 1.682 |
| 26.0986 | 1.686 |
| 26.1108 | 1.69 |
| 26.123 | 1.695 |
| 26.1353 | 1.699 |
| 26.1475 | 1.704 |
| 26.1597 | 1.709 |
| 26.1719 | 1.714 |
| 26.1841 | 1.719 |
| 26.1963 | 1.724 |
| 26.2085 | 1.73 |
| 26.2207 | 1.736 |
| 26.2329 | 1.742 |
| 26.2451 | 1.748 |
| 26.2573 | 1.754 |
| 26.2695 | 1.761 |
| 26.2817 | 1.768 |
| 26.2939 | 1.775 |
| 26.3062 | 1.782 |
| 26.3184 | 1.789 |
| 26.3306 | 1.797 |
| 26.3428 | 1.805 |
| 26.355 | 1.813 |
| 26.3672 | 1.821 |
| 26.3794 | 1.83 |
| 26.3916 | 1.838 |
| 26.4038 | 1.847 |
| 26.416 | 1.856 |
| 26.4282 | 1.866 |
| 26.4404 | 1.876 |
| 26.4526 | 1.885 |
| 26.4648 | 1.895 |
| 26.477 | 1.906 |
| 26.4893 | 1.916 |
| 26.5015 | 1.927 |
| 26.5137 | 1.938 |
| 26.5259 | 1.95 |
| 26.5381 | 1.961 |
| 26.5503 | 1.973 |
| 26.5625 | 1.985 |
| 26.5747 | 1.997 |
| 26.5869 | 2.01 |
| 26.5991 | 2.022 |
| 26.6113 | 2.035 |
| 26.6235 | 2.049 |
| 26.6357 | 2.062 |
| 26.6479 | 2.076 |
| 26.6602 | 2.09 |
| 26.6724 | 2.104 |
| 26.6846 | 2.119 |
| 26.6968 | 2.133 |
| 26.709 | 2.148 |
| 26.7212 | 2.164 |
| 26.7334 | 2.179 |
| 26.7456 | 2.195 |
| 26.7578 | 2.211 |
| 26.77 | 2.227 |
| 26.7822 | 2.243 |
| 26.7944 | 2.26 |
| 26.8066 | 2.276 |
| 26.8188 | 2.293 |
| 26.8311 | 2.31 |
| 26.8433 | 2.327 |
| 26.8555 | 2.345 |
| 26.8677 | 2.362 |
| 26.8799 | 2.38 |
| 26.8921 | 2.398 |
| 26.9043 | 2.416 |
| 26.9165 | 2.434 |
| 26.9287 | 2.452 |
| 26.9409 | 2.47 |
| 26.9531 | 2.488 |
| 26.9653 | 2.506 |
| 26.9775 | 2.524 |
| 26.9897 | 2.542 |
| 27.002 | 2.56 |
| 27.0142 | 2.578 |
| 27.0264 | 2.596 |
| 27.0386 | 2.613 |
| 27.0508 | 2.631 |
| 27.063 | 2.648 |
| 27.0752 | 2.665 |
| 27.0874 | 2.682 |
| 27.0996 | 2.698 |
| 27.1118 | 2.714 |
| 27.124 | 2.73 |
| 27.1362 | 2.745 |
| 27.1484 | 2.759 |
| 27.1606 | 2.773 |
| 27.1729 | 2.787 |
| 27.1851 | 2.8 |
| 27.1973 | 2.812 |
| 27.2095 | 2.824 |
| 27.2217 | 2.835 |
| 27.2339 | 2.845 |
| 27.2461 | 2.854 |
| 27.2583 | 2.863 |
| 27.2705 | 2.871 |
| 27.2827 | 2.878 |
| 27.2949 | 2.884 |
| 27.3071 | 2.889 |
| 27.3193 | 2.893 |
| 27.3315 | 2.896 |
| 27.3438 | 2.898 |
| 27.356 | 2.899 |
| 27.3682 | 2.9 |
| 27.3804 | 2.899 |
| 27.3926 | 2.897 |
| 27.4048 | 2.894 |
| 27.417 | 2.891 |
| 27.4292 | 2.886 |
| 27.4414 | 2.88 |
| 27.4536 | 2.874 |
| 27.4658 | 2.866 |
| 27.478 | 2.858 |
| 27.4902 | 2.849 |
| 27.5024 | 2.838 |
| 27.5146 | 2.828 |
| 27.5269 | 2.816 |
| 27.5391 | 2.803 |
| 27.5513 | 2.79 |
| 27.5635 | 2.776 |
| 27.5757 | 2.762 |
| 27.5879 | 2.747 |
| 27.6001 | 2.731 |
| 27.6123 | 2.715 |
| 27.6245 | 2.699 |
| 27.6367 | 2.682 |
| 27.6489 | 2.665 |
| 27.6611 | 2.647 |
| 27.6733 | 2.629 |
| 27.6855 | 2.61 |
| 27.6978 | 2.592 |
| 27.71 | 2.573 |
| 27.7222 | 2.554 |
| 27.7344 | 2.535 |
| 27.7466 | 2.516 |
| 27.7588 | 2.497 |
| 27.771 | 2.477 |
| 27.7832 | 2.458 |
| 27.7954 | 2.438 |
| 27.8076 | 2.419 |
| 27.8198 | 2.4 |
| 27.832 | 2.381 |
| 27.8442 | 2.361 |
| 27.8564 | 2.342 |
| 27.8687 | 2.323 |
| 27.8809 | 2.304 |
| 27.8931 | 2.286 |
| 27.9053 | 2.267 |
| 27.9175 | 2.249 |
| 27.9297 | 2.231 |
| 27.9419 | 2.213 |
| 27.9541 | 2.195 |
| 27.9663 | 2.177 |
| 27.9785 | 2.16 |
| 27.9907 | 2.143 |
| 28.0029 | 2.126 |
| 28.0151 | 2.109 |
| 28.0273 | 2.093 |
| 28.0396 | 2.076 |
| 28.0518 | 2.06 |
| 28.064 | 2.045 |
| 28.0762 | 2.029 |
| 28.0884 | 2.014 |
| 28.1006 | 1.999 |
| 28.1128 | 1.984 |
| 28.125 | 1.97 |
| 28.1372 | 1.955 |
| 28.1494 | 1.941 |
| 28.1616 | 1.928 |
| 28.1738 | 1.914 |
| 28.186 | 1.901 |
| 28.1982 | 1.888 |
| 28.2104 | 1.875 |
| 28.2227 | 1.863 |
| 28.2349 | 1.85 |
| 28.2471 | 1.838 |
| 28.2593 | 1.827 |
| 28.2715 | 1.815 |
| 28.2837 | 1.804 |
| 28.2959 | 1.793 |
| 28.3081 | 1.782 |
| 28.3203 | 1.771 |
| 28.3325 | 1.761 |
| 28.3447 | 1.751 |
| 28.3569 | 1.741 |
| 28.3691 | 1.731 |
| 28.3813 | 1.722 |
| 28.3936 | 1.712 |
| 28.4058 | 1.703 |
| 28.418 | 1.694 |
| 28.4302 | 1.686 |
| 28.4424 | 1.677 |
| 28.4546 | 1.669 |
| 28.4668 | 1.661 |
| 28.479 | 1.653 |
| 28.4912 | 1.646 |
| 28.5034 | 1.638 |
| 28.5156 | 1.631 |
| 28.5278 | 1.624 |
| 28.54 | 1.617 |
| 28.5522 | 1.61 |
| 28.5645 | 1.604 |
| 28.5767 | 1.598 |
| 28.5889 | 1.591 |
| 28.6011 | 1.586 |
| 28.6133 | 1.58 |
| 28.6255 | 1.574 |
| 28.6377 | 1.569 |
| 28.6499 | 1.563 |
| 28.6621 | 1.558 |
| 28.6743 | 1.553 |
| 28.6865 | 1.549 |
| 28.6987 | 1.544 |
| 28.7109 | 1.54 |
| 28.7231 | 1.535 |
| 28.7354 | 1.531 |
| 28.7476 | 1.527 |
| 28.7598 | 1.524 |
| 28.772 | 1.52 |
| 28.7842 | 1.516 |
| 28.7964 | 1.513 |
| 28.8086 | 1.51 |
| 28.8208 | 1.507 |
| 28.833 | 1.504 |
| 28.8452 | 1.501 |
| 28.8574 | 1.499 |
| 28.8696 | 1.496 |
| 28.8818 | 1.494 |
| 28.894 | 1.492 |
| 28.9062 | 1.49 |
| 28.9185 | 1.488 |
| 28.9307 | 1.486 |
| 28.9429 | 1.485 |
| 28.9551 | 1.483 |
| 28.9673 | 1.482 |
| 28.9795 | 1.481 |
| 28.9917 | 1.48 |
| 29.0039 | 1.479 |
| 29.0161 | 1.478 |
| 29.0283 | 1.478 |
| 29.0405 | 1.477 |
| 29.0527 | 1.477 |
| 29.0649 | 1.477 |
| 29.0771 | 1.477 |
| 29.0894 | 1.477 |
| 29.1016 | 1.477 |
| 29.1138 | 1.478 |
| 29.126 | 1.478 |
| 29.1382 | 1.479 |
| 29.1504 | 1.48 |
| 29.1626 | 1.481 |
| 29.1748 | 1.482 |
| 29.187 | 1.483 |
| 29.1992 | 1.485 |
| 29.2114 | 1.486 |
| 29.2236 | 1.488 |
| 29.2358 | 1.49 |
| 29.248 | 1.492 |
| 29.2603 | 1.494 |
| 29.2725 | 1.496 |
| 29.2847 | 1.498 |
| 29.2969 | 1.501 |
| 29.3091 | 1.504 |
| 29.3213 | 1.506 |
| 29.3335 | 1.509 |
| 29.3457 | 1.512 |
| 29.3579 | 1.516 |
| 29.3701 | 1.519 |
| 29.3823 | 1.523 |
| 29.3945 | 1.526 |
| 29.4067 | 1.53 |
| 29.4189 | 1.534 |
| 29.4312 | 1.538 |
| 29.4434 | 1.543 |
| 29.4556 | 1.547 |
| 29.4678 | 1.552 |
| 29.48 | 1.557 |
| 29.4922 | 1.562 |
| 29.5044 | 1.567 |
| 29.5166 | 1.572 |
| 29.5288 | 1.578 |
| 29.541 | 1.583 |
| 29.5532 | 1.589 |
| 29.5654 | 1.595 |
| 29.5776 | 1.601 |
| 29.5898 | 1.607 |
| 29.6021 | 1.614 |
| 29.6143 | 1.62 |
| 29.6265 | 1.627 |
| 29.6387 | 1.634 |
| 29.6509 | 1.641 |
| 29.6631 | 1.649 |
| 29.6753 | 1.656 |
| 29.6875 | 1.664 |
| 29.6997 | 1.672 |
| 29.7119 | 1.68 |
| 29.7241 | 1.688 |
| 29.7363 | 1.697 |
| 29.7485 | 1.705 |
| 29.7607 | 1.714 |
| 29.7729 | 1.723 |
| 29.7852 | 1.733 |
| 29.7974 | 1.742 |
| 29.8096 | 1.752 |
| 29.8218 | 1.762 |
| 29.834 | 1.772 |
| 29.8462 | 1.782 |
| 29.8584 | 1.792 |
| 29.8706 | 1.803 |
| 29.8828 | 1.814 |
| 29.895 | 1.825 |
| 29.9072 | 1.836 |
| 29.9194 | 1.847 |
| 29.9316 | 1.859 |
| 29.9438 | 1.871 |
| 29.9561 | 1.883 |
| 29.9683 | 1.895 |
| 29.9805 | 1.908 |
| 29.9927 | 1.92 |
| 30.0049 | 1.933 |
| 30.0171 | 1.946 |
| 30.0293 | 1.959 |
| 30.0415 | 1.973 |
| 30.0537 | 1.986 |
| 30.0659 | 2 |
| 30.0781 | 2.014 |
| 30.0903 | 2.028 |
| 30.1025 | 2.043 |
| 30.1147 | 2.057 |
| 30.127 | 2.072 |
| 30.1392 | 2.087 |
| 30.1514 | 2.102 |
| 30.1636 | 2.117 |
| 30.1758 | 2.132 |
| 30.188 | 2.147 |
| 30.2002 | 2.163 |
| 30.2124 | 2.178 |
| 30.2246 | 2.194 |
| 30.2368 | 2.209 |
| 30.249 | 2.225 |
| 30.2612 | 2.241 |
| 30.2734 | 2.257 |
| 30.2856 | 2.273 |
| 30.2979 | 2.288 |
| 30.3101 | 2.304 |
| 30.3223 | 2.32 |
| 30.3345 | 2.336 |
| 30.3467 | 2.351 |
| 30.3589 | 2.367 |
| 30.3711 | 2.382 |
| 30.3833 | 2.397 |
| 30.3955 | 2.412 |
| 30.4077 | 2.427 |
| 30.4199 | 2.442 |
| 30.4321 | 2.456 |
| 30.4443 | 2.47 |
| 30.4565 | 2.484 |
| 30.4688 | 2.498 |
| 30.481 | 2.511 |
| 30.4932 | 2.523 |
| 30.5054 | 2.536 |
| 30.5176 | 2.547 |
| 30.5298 | 2.559 |
| 30.542 | 2.57 |
| 30.5542 | 2.58 |
| 30.5664 | 2.59 |
| 30.5786 | 2.599 |
| 30.5908 | 2.607 |
| 30.603 | 2.615 |
| 30.6152 | 2.622 |
| 30.6274 | 2.629 |
| 30.6396 | 2.635 |
| 30.6519 | 2.64 |
| 30.6641 | 2.644 |
| 30.6763 | 2.648 |
| 30.6885 | 2.651 |
| 30.7007 | 2.653 |
| 30.7129 | 2.655 |
| 30.7251 | 2.655 |
| 30.7373 | 2.655 |
| 30.7495 | 2.654 |
| 30.7617 | 2.653 |
| 30.7739 | 2.65 |
| 30.7861 | 2.647 |
| 30.7983 | 2.643 |
| 30.8105 | 2.639 |
| 30.8228 | 2.633 |
| 30.835 | 2.627 |
| 30.8472 | 2.621 |
| 30.8594 | 2.613 |
| 30.8716 | 2.605 |
| 30.8838 | 2.597 |
| 30.896 | 2.588 |
| 30.9082 | 2.578 |
| 30.9204 | 2.568 |
| 30.9326 | 2.557 |
| 30.9448 | 2.546 |
| 30.957 | 2.534 |
| 30.9692 | 2.522 |
| 30.9814 | 2.509 |
| 30.9937 | 2.496 |
| 31.0059 | 2.483 |
| 31.0181 | 2.47 |
| 31.0303 | 2.456 |
| 31.0425 | 2.442 |
| 31.0547 | 2.428 |
| 31.0669 | 2.413 |
| 31.0791 | 2.399 |
| 31.0913 | 2.384 |
| 31.1035 | 2.369 |
| 31.1157 | 2.354 |
| 31.1279 | 2.339 |
| 31.1401 | 2.324 |
| 31.1523 | 2.308 |
| 31.1646 | 2.293 |
| 31.1768 | 2.278 |
| 31.189 | 2.263 |
| 31.2012 | 2.248 |
| 31.2134 | 2.232 |
| 31.2256 | 2.217 |
| 31.2378 | 2.202 |
| 31.25 | 2.187 |
| 31.2622 | 2.172 |
| 31.2744 | 2.158 |
| 31.2866 | 2.143 |
| 31.2988 | 2.129 |
| 31.311 | 2.114 |
| 31.3232 | 2.1 |
| 31.3354 | 2.086 |
| 31.3477 | 2.072 |
| 31.3599 | 2.058 |
| 31.3721 | 2.044 |
| 31.3843 | 2.031 |
| 31.3965 | 2.018 |
| 31.4087 | 2.005 |
| 31.4209 | 1.992 |
| 31.4331 | 1.979 |
| 31.4453 | 1.967 |
| 31.4575 | 1.954 |
| 31.4697 | 1.942 |
| 31.4819 | 1.93 |
| 31.4941 | 1.918 |
| 31.5063 | 1.907 |
| 31.5186 | 1.895 |
| 31.5308 | 1.884 |
| 31.543 | 1.873 |
| 31.5552 | 1.863 |
| 31.5674 | 1.852 |
| 31.5796 | 1.842 |
| 31.5918 | 1.832 |
| 31.604 | 1.822 |
| 31.6162 | 1.812 |
| 31.6284 | 1.802 |
| 31.6406 | 1.793 |
| 31.6528 | 1.784 |
| 31.665 | 1.775 |
| 31.6772 | 1.766 |
| 31.6895 | 1.757 |
| 31.7017 | 1.749 |
| 31.7139 | 1.741 |
| 31.7261 | 1.733 |
| 31.7383 | 1.725 |
| 31.7505 | 1.717 |
| 31.7627 | 1.71 |
| 31.7749 | 1.703 |
| 31.7871 | 1.696 |
| 31.7993 | 1.689 |
| 31.8115 | 1.682 |
| 31.8237 | 1.676 |
| 31.8359 | 1.669 |
| 31.8481 | 1.663 |
| 31.8604 | 1.657 |
| 31.8726 | 1.651 |
| 31.8848 | 1.646 |
| 31.897 | 1.64 |
| 31.9092 | 1.635 |
| 31.9214 | 1.63 |
| 31.9336 | 1.625 |
| 31.9458 | 1.62 |
| 31.958 | 1.615 |
| 31.9702 | 1.611 |
| 31.9824 | 1.606 |
| 31.9946 | 1.602 |
| 32.0068 | 1.598 |
| 32.019 | 1.594 |
| 32.0313 | 1.591 |
| 32.0435 | 1.587 |
| 32.0557 | 1.584 |
| 32.0679 | 1.581 |
| 32.0801 | 1.578 |
| 32.0923 | 1.575 |
| 32.1045 | 1.572 |
| 32.1167 | 1.569 |
| 32.1289 | 1.567 |
| 32.1411 | 1.565 |
| 32.1533 | 1.562 |
| 32.1655 | 1.56 |
| 32.1777 | 1.559 |
| 32.1899 | 1.557 |
| 32.2021 | 1.555 |
| 32.2144 | 1.554 |
| 32.2266 | 1.553 |
| 32.2388 | 1.552 |
| 32.251 | 1.551 |
| 32.2632 | 1.55 |
| 32.2754 | 1.549 |
| 32.2876 | 1.549 |
| 32.2998 | 1.548 |
| 32.312 | 1.548 |
| 32.3242 | 1.548 |
| 32.3364 | 1.548 |
| 32.3486 | 1.548 |
| 32.3608 | 1.548 |
| 32.373 | 1.549 |
| 32.3853 | 1.55 |
| 32.3975 | 1.55 |
| 32.4097 | 1.551 |
| 32.4219 | 1.552 |
| 32.4341 | 1.553 |
| 32.4463 | 1.555 |
| 32.4585 | 1.556 |
| 32.4707 | 1.558 |
| 32.4829 | 1.56 |
| 32.4951 | 1.562 |
| 32.5073 | 1.564 |
| 32.5195 | 1.566 |
| 32.5317 | 1.568 |
| 32.5439 | 1.571 |
| 32.5562 | 1.574 |
| 32.5684 | 1.576 |
| 32.5806 | 1.579 |
| 32.5928 | 1.582 |
| 32.605 | 1.586 |
| 32.6172 | 1.589 |
| 32.6294 | 1.593 |
| 32.6416 | 1.597 |
| 32.6538 | 1.6 |
| 32.666 | 1.605 |
| 32.6782 | 1.609 |
| 32.6904 | 1.613 |
| 32.7026 | 1.618 |
| 32.7148 | 1.622 |
| 32.7271 | 1.627 |
| 32.7393 | 1.632 |
| 32.7515 | 1.637 |
| 32.7637 | 1.643 |
| 32.7759 | 1.648 |
| 32.7881 | 1.654 |
| 32.8003 | 1.66 |
| 32.8125 | 1.666 |
| 32.8247 | 1.672 |
| 32.8369 | 1.678 |
| 32.8491 | 1.685 |
| 32.8613 | 1.692 |
| 32.8735 | 1.698 |
| 32.8857 | 1.705 |
| 32.8979 | 1.713 |
| 32.9102 | 1.72 |
| 32.9224 | 1.728 |
| 32.9346 | 1.735 |
| 32.9468 | 1.743 |
| 32.959 | 1.752 |
| 32.9712 | 1.76 |
| 32.9834 | 1.768 |
| 32.9956 | 1.777 |
| 33.0078 | 1.786 |
| 33.02 | 1.795 |
| 33.0322 | 1.804 |
| 33.0444 | 1.814 |
| 33.0566 | 1.823 |
| 33.0688 | 1.833 |
| 33.0811 | 1.843 |
| 33.0933 | 1.853 |
| 33.1055 | 1.864 |
| 33.1177 | 1.874 |
| 33.1299 | 1.885 |
| 33.1421 | 1.896 |
| 33.1543 | 1.907 |
| 33.1665 | 1.918 |
| 33.1787 | 1.93 |
| 33.1909 | 1.941 |
| 33.2031 | 1.953 |
| 33.2153 | 1.965 |
| 33.2275 | 1.978 |
| 33.2397 | 1.99 |
| 33.252 | 2.002 |
| 33.2642 | 2.015 |
| 33.2764 | 2.028 |
| 33.2886 | 2.041 |
| 33.3008 | 2.054 |
| 33.313 | 2.068 |
| 33.3252 | 2.081 |
| 33.3374 | 2.095 |
| 33.3496 | 2.109 |
| 33.3618 | 2.122 |
| 33.374 | 2.136 |
| 33.3862 | 2.151 |
| 33.3984 | 2.165 |
| 33.4106 | 2.179 |
| 33.4229 | 2.193 |
| 33.4351 | 2.208 |
| 33.4473 | 2.222 |
| 33.4595 | 2.237 |
| 33.4717 | 2.251 |
| 33.4839 | 2.266 |
| 33.4961 | 2.281 |
| 33.5083 | 2.295 |
| 33.5205 | 2.31 |
| 33.5327 | 2.324 |
| 33.5449 | 2.339 |
| 33.5571 | 2.353 |
| 33.5693 | 2.367 |
| 33.5815 | 2.381 |
| 33.5938 | 2.395 |
| 33.606 | 2.409 |
| 33.6182 | 2.423 |
| 33.6304 | 2.436 |
| 33.6426 | 2.449 |
| 33.6548 | 2.462 |
| 33.667 | 2.475 |
| 33.6792 | 2.487 |
| 33.6914 | 2.499 |
| 33.7036 | 2.511 |
| 33.7158 | 2.522 |
| 33.728 | 2.533 |
| 33.7402 | 2.543 |
| 33.7524 | 2.553 |
| 33.7646 | 2.563 |
| 33.7769 | 2.572 |
| 33.7891 | 2.58 |
| 33.8013 | 2.588 |
| 33.8135 | 2.595 |
| 33.8257 | 2.602 |
| 33.8379 | 2.608 |
| 33.8501 | 2.614 |
| 33.8623 | 2.619 |
| 33.8745 | 2.623 |
| 33.8867 | 2.627 |
| 33.8989 | 2.63 |
| 33.9111 | 2.632 |
| 33.9233 | 2.634 |
| 33.9355 | 2.635 |
| 33.9478 | 2.635 |
| 33.96 | 2.635 |
| 33.9722 | 2.633 |
| 33.9844 | 2.632 |
| 33.9966 | 2.629 |
| 34.0088 | 2.626 |
| 34.021 | 2.622 |
| 34.0332 | 2.618 |
| 34.0454 | 2.613 |
| 34.0576 | 2.607 |
| 34.0698 | 2.601 |
| 34.082 | 2.594 |
| 34.0942 | 2.587 |
| 34.1064 | 2.579 |
| 34.1187 | 2.571 |
| 34.1309 | 2.562 |
| 34.1431 | 2.552 |
| 34.1553 | 2.542 |
| 34.1675 | 2.532 |
| 34.1797 | 2.521 |
| 34.1919 | 2.51 |
| 34.2041 | 2.499 |
| 34.2163 | 2.487 |
| 34.2285 | 2.475 |
| 34.2407 | 2.463 |
| 34.2529 | 2.45 |
| 34.2651 | 2.437 |
| 34.2773 | 2.424 |
| 34.2896 | 2.411 |
| 34.3018 | 2.397 |
| 34.314 | 2.384 |
| 34.3262 | 2.37 |
| 34.3384 | 2.356 |
| 34.3506 | 2.342 |
| 34.3628 | 2.328 |
| 34.375 | 2.314 |
| 34.3872 | 2.3 |
| 34.3994 | 2.286 |
| 34.4116 | 2.271 |
| 34.4238 | 2.257 |
| 34.436 | 2.243 |
| 34.4482 | 2.229 |
| 34.4604 | 2.215 |
| 34.4727 | 2.201 |
| 34.4849 | 2.187 |
| 34.4971 | 2.173 |
| 34.5093 | 2.16 |
| 34.5215 | 2.146 |
| 34.5337 | 2.133 |
| 34.5459 | 2.119 |
| 34.5581 | 2.106 |
| 34.5703 | 2.093 |
| 34.5825 | 2.08 |
| 34.5947 | 2.067 |
| 34.6069 | 2.054 |
| 34.6191 | 2.042 |
| 34.6313 | 2.029 |
| 34.6436 | 2.017 |
| 34.6558 | 2.005 |
| 34.668 | 1.993 |
| 34.6802 | 1.982 |
| 34.6924 | 1.97 |
| 34.7046 | 1.959 |
| 34.7168 | 1.948 |
| 34.729 | 1.937 |
| 34.7412 | 1.926 |
| 34.7534 | 1.915 |
| 34.7656 | 1.905 |
| 34.7778 | 1.895 |
| 34.79 | 1.884 |
| 34.8022 | 1.875 |
| 34.8145 | 1.865 |
| 34.8267 | 1.855 |
| 34.8389 | 1.846 |
| 34.8511 | 1.837 |
| 34.8633 | 1.828 |
| 34.8755 | 1.819 |
| 34.8877 | 1.811 |
| 34.8999 | 1.802 |
| 34.9121 | 1.794 |
| 34.9243 | 1.786 |
| 34.9365 | 1.778 |
| 34.9487 | 1.771 |
| 34.9609 | 1.763 |
| 34.9731 | 1.756 |
| 34.9854 | 1.749 |
| 34.9976 | 1.742 |
| 35.0098 | 1.735 |
| 35.022 | 1.729 |
| 35.0342 | 1.722 |
| 35.0464 | 1.716 |
| 35.0586 | 1.71 |
| 35.0708 | 1.704 |
| 35.083 | 1.698 |
| 35.0952 | 1.693 |
| 35.1074 | 1.687 |
| 35.1196 | 1.682 |
| 35.1318 | 1.677 |
| 35.144 | 1.672 |
| 35.1563 | 1.667 |
| 35.1685 | 1.663 |
| 35.1807 | 1.658 |
| 35.1929 | 1.654 |
| 35.2051 | 1.65 |
| 35.2173 | 1.646 |
| 35.2295 | 1.642 |
| 35.2417 | 1.639 |
| 35.2539 | 1.635 |
| 35.2661 | 1.632 |
| 35.2783 | 1.629 |
| 35.2905 | 1.626 |
| 35.3027 | 1.623 |
| 35.3149 | 1.621 |
| 35.3271 | 1.618 |
| 35.3394 | 1.616 |
| 35.3516 | 1.613 |
| 35.3638 | 1.611 |
| 35.376 | 1.609 |
| 35.3882 | 1.608 |
| 35.4004 | 1.606 |
| 35.4126 | 1.605 |
| 35.4248 | 1.603 |
| 35.437 | 1.602 |
| 35.4492 | 1.601 |
| 35.4614 | 1.6 |
| 35.4736 | 1.599 |
| 35.4858 | 1.599 |
| 35.498 | 1.598 |
| 35.5103 | 1.598 |
| 35.5225 | 1.598 |
| 35.5347 | 1.598 |
| 35.5469 | 1.598 |
| 35.5591 | 1.598 |
| 35.5713 | 1.599 |
| 35.5835 | 1.599 |
| 35.5957 | 1.6 |
| 35.6079 | 1.601 |
| 35.6201 | 1.602 |
| 35.6323 | 1.603 |
| 35.6445 | 1.604 |
| 35.6567 | 1.606 |
| 35.6689 | 1.607 |
| 35.6812 | 1.609 |
| 35.6934 | 1.611 |
| 35.7056 | 1.613 |
| 35.7178 | 1.615 |
| 35.73 | 1.617 |
| 35.7422 | 1.62 |
| 35.7544 | 1.622 |
| 35.7666 | 1.625 |
| 35.7788 | 1.628 |
| 35.791 | 1.631 |
| 35.8032 | 1.634 |
| 35.8154 | 1.638 |
| 35.8276 | 1.641 |
| 35.8398 | 1.645 |
| 35.8521 | 1.649 |
| 35.8643 | 1.653 |
| 35.8765 | 1.657 |
| 35.8887 | 1.661 |
| 35.9009 | 1.665 |
| 35.9131 | 1.67 |
| 35.9253 | 1.675 |
| 35.9375 | 1.679 |
| 35.9497 | 1.684 |
| 35.9619 | 1.69 |
| 35.9741 | 1.695 |
| 35.9863 | 1.7 |
| 35.9985 | 1.706 |
| 36.0107 | 1.712 |
| 36.0229 | 1.718 |
| 36.0352 | 1.724 |
| 36.0474 | 1.73 |
| 36.0596 | 1.737 |
| 36.0718 | 1.743 |
| 36.084 | 1.75 |
| 36.0962 | 1.757 |
| 36.1084 | 1.764 |
| 36.1206 | 1.771 |
| 36.1328 | 1.778 |
| 36.145 | 1.786 |
| 36.1572 | 1.793 |
| 36.1694 | 1.801 |
| 36.1816 | 1.809 |
| 36.1938 | 1.817 |
| 36.2061 | 1.826 |
| 36.2183 | 1.834 |
| 36.2305 | 1.843 |
| 36.2427 | 1.851 |
| 36.2549 | 1.86 |
| 36.2671 | 1.869 |
| 36.2793 | 1.878 |
| 36.2915 | 1.888 |
| 36.3037 | 1.897 |
| 36.3159 | 1.907 |
| 36.3281 | 1.917 |
| 36.3403 | 1.926 |
| 36.3525 | 1.936 |
| 36.3647 | 1.946 |
| 36.377 | 1.957 |
| 36.3892 | 1.967 |
| 36.4014 | 1.977 |
| 36.4136 | 1.988 |
| 36.4258 | 1.999 |
| 36.438 | 2.009 |
| 36.4502 | 2.02 |
| 36.4624 | 2.031 |
| 36.4746 | 2.042 |
| 36.4868 | 2.053 |
| 36.499 | 2.064 |
| 36.5112 | 2.075 |
| 36.5234 | 2.087 |
| 36.5356 | 2.098 |
| 36.5479 | 2.109 |
| 36.5601 | 2.12 |
| 36.5723 | 2.132 |
| 36.5845 | 2.143 |
| 36.5967 | 2.154 |
| 36.6089 | 2.165 |
| 36.6211 | 2.176 |
| 36.6333 | 2.188 |
| 36.6455 | 2.199 |
| 36.6577 | 2.209 |
| 36.6699 | 2.22 |
| 36.6821 | 2.231 |
| 36.6943 | 2.241 |
| 36.7065 | 2.252 |
| 36.7188 | 2.262 |
| 36.731 | 2.272 |
| 36.7432 | 2.282 |
| 36.7554 | 2.291 |
| 36.7676 | 2.301 |
| 36.7798 | 2.31 |
| 36.792 | 2.318 |
| 36.8042 | 2.327 |
| 36.8164 | 2.335 |
| 36.8286 | 2.343 |
| 36.8408 | 2.35 |
| 36.853 | 2.358 |
| 36.8652 | 2.364 |
| 36.8774 | 2.371 |
| 36.8896 | 2.377 |
| 36.9019 | 2.382 |
| 36.9141 | 2.387 |
| 36.9263 | 2.392 |
| 36.9385 | 2.396 |
| 36.9507 | 2.399 |
| 36.9629 | 2.403 |
| 36.9751 | 2.405 |
| 36.9873 | 2.407 |
| 36.9995 | 2.409 |
| 37.0117 | 2.41 |
| 37.0239 | 2.411 |
| 37.0361 | 2.411 |
| 37.0483 | 2.41 |
| 37.0605 | 2.409 |
| 37.0728 | 2.408 |
| 37.085 | 2.405 |
| 37.0972 | 2.403 |
| 37.1094 | 2.4 |
| 37.1216 | 2.396 |
| 37.1338 | 2.392 |
| 37.146 | 2.387 |
| 37.1582 | 2.382 |
| 37.1704 | 2.376 |
| 37.1826 | 2.37 |
| 37.1948 | 2.364 |
| 37.207 | 2.357 |
| 37.2192 | 2.349 |
| 37.2314 | 2.341 |
| 37.2437 | 2.333 |
| 37.2559 | 2.324 |
| 37.2681 | 2.315 |
| 37.2803 | 2.306 |
| 37.2925 | 2.296 |
| 37.3047 | 2.286 |
| 37.3169 | 2.276 |
| 37.3291 | 2.266 |
| 37.3413 | 2.255 |
| 37.3535 | 2.244 |
| 37.3657 | 2.233 |
| 37.3779 | 2.221 |
| 37.3901 | 2.209 |
| 37.4023 | 2.198 |
| 37.4146 | 2.186 |
| 37.4268 | 2.174 |
| 37.439 | 2.161 |
| 37.4512 | 2.149 |
| 37.4634 | 2.137 |
| 37.4756 | 2.124 |
| 37.4878 | 2.112 |
| 37.5 | 2.099 |
| 37.5122 | 2.087 |
| 37.5244 | 2.074 |
| 37.5366 | 2.062 |
| 37.5488 | 2.049 |
| 37.561 | 2.036 |
| 37.5732 | 2.024 |
| 37.5854 | 2.011 |
| 37.5977 | 1.999 |
| 37.6099 | 1.987 |
| 37.6221 | 1.974 |
| 37.6343 | 1.962 |
| 37.6465 | 1.95 |
| 37.6587 | 1.938 |
| 37.6709 | 1.926 |
| 37.6831 | 1.914 |
| 37.6953 | 1.902 |
| 37.7075 | 1.89 |
| 37.7197 | 1.879 |
| 37.7319 | 1.867 |
| 37.7441 | 1.856 |
| 37.7563 | 1.845 |
| 37.7686 | 1.834 |
| 37.7808 | 1.823 |
| 37.793 | 1.812 |
| 37.8052 | 1.802 |
| 37.8174 | 1.791 |
| 37.8296 | 1.781 |
| 37.8418 | 1.771 |
| 37.854 | 1.76 |
| 37.8662 | 1.751 |
| 37.8784 | 1.741 |
| 37.8906 | 1.731 |
| 37.9028 | 1.722 |
| 37.915 | 1.712 |
| 37.9272 | 1.703 |
| 37.9395 | 1.694 |
| 37.9517 | 1.686 |
| 37.9639 | 1.677 |
| 37.9761 | 1.668 |
| 37.9883 | 1.66 |
| 38.0005 | 1.652 |
| 38.0127 | 1.644 |
| 38.0249 | 1.636 |
| 38.0371 | 1.628 |
| 38.0493 | 1.62 |
| 38.0615 | 1.613 |
| 38.0737 | 1.606 |
| 38.0859 | 1.599 |
| 38.0981 | 1.592 |
| 38.1104 | 1.585 |
| 38.1226 | 1.578 |
| 38.1348 | 1.572 |
| 38.147 | 1.565 |
| 38.1592 | 1.559 |
| 38.1714 | 1.553 |
| 38.1836 | 1.547 |
| 38.1958 | 1.541 |
| 38.208 | 1.535 |
| 38.2202 | 1.53 |
| 38.2324 | 1.524 |
| 38.2446 | 1.519 |
| 38.2568 | 1.514 |
| 38.269 | 1.509 |
| 38.2813 | 1.504 |
| 38.2935 | 1.5 |
| 38.3057 | 1.495 |
| 38.3179 | 1.491 |
| 38.3301 | 1.486 |
| 38.3423 | 1.482 |
| 38.3545 | 1.478 |
| 38.3667 | 1.474 |
| 38.3789 | 1.471 |
| 38.3911 | 1.467 |
| 38.4033 | 1.464 |
| 38.4155 | 1.46 |
| 38.4277 | 1.457 |
| 38.4399 | 1.454 |
| 38.4521 | 1.451 |
| 38.4644 | 1.448 |
| 38.4766 | 1.445 |
| 38.4888 | 1.443 |
| 38.501 | 1.44 |
| 38.5132 | 1.438 |
| 38.5254 | 1.436 |
| 38.5376 | 1.433 |
| 38.5498 | 1.432 |
| 38.562 | 1.43 |
| 38.5742 | 1.428 |
| 38.5864 | 1.426 |
| 38.5986 | 1.425 |
| 38.6108 | 1.423 |
| 38.623 | 1.422 |
| 38.6353 | 1.421 |
| 38.6475 | 1.42 |
| 38.6597 | 1.419 |
| 38.6719 | 1.418 |
| 38.6841 | 1.418 |
| 38.6963 | 1.417 |
| 38.7085 | 1.417 |
| 38.7207 | 1.416 |
| 38.7329 | 1.416 |
| 38.7451 | 1.416 |
| 38.7573 | 1.416 |
| 38.7695 | 1.416 |
| 38.7817 | 1.416 |
| 38.7939 | 1.417 |
| 38.8062 | 1.417 |
| 38.8184 | 1.418 |
| 38.8306 | 1.419 |
| 38.8428 | 1.419 |
| 38.855 | 1.42 |
| 38.8672 | 1.421 |
| 38.8794 | 1.423 |
| 38.8916 | 1.424 |
| 38.9038 | 1.425 |
| 38.916 | 1.427 |
| 38.9282 | 1.429 |
| 38.9404 | 1.43 |
| 38.9526 | 1.432 |
| 38.9648 | 1.434 |
| 38.9771 | 1.436 |
| 38.9893 | 1.439 |
| 39.0015 | 1.441 |
| 39.0137 | 1.444 |
| 39.0259 | 1.446 |
| 39.0381 | 1.449 |
| 39.0503 | 1.452 |
| 39.0625 | 1.455 |
| 39.0747 | 1.458 |
| 39.0869 | 1.461 |
| 39.0991 | 1.464 |
| 39.1113 | 1.468 |
| 39.1235 | 1.471 |
| 39.1357 | 1.475 |
| 39.1479 | 1.479 |
| 39.1602 | 1.483 |
| 39.1724 | 1.487 |
| 39.1846 | 1.491 |
| 39.1968 | 1.495 |
| 39.209 | 1.499 |
| 39.2212 | 1.504 |
| 39.2334 | 1.509 |
| 39.2456 | 1.513 |
| 39.2578 | 1.518 |
| 39.27 | 1.523 |
| 39.2822 | 1.528 |
| 39.2944 | 1.534 |
| 39.3066 | 1.539 |
| 39.3188 | 1.545 |
| 39.3311 | 1.55 |
| 39.3433 | 1.556 |
| 39.3555 | 1.562 |
| 39.3677 | 1.568 |
| 39.3799 | 1.574 |
| 39.3921 | 1.58 |
| 39.4043 | 1.587 |
| 39.4165 | 1.593 |
| 39.4287 | 1.6 |
| 39.4409 | 1.606 |
| 39.4531 | 1.613 |
| 39.4653 | 1.62 |
| 39.4775 | 1.627 |
| 39.4897 | 1.635 |
| 39.502 | 1.642 |
| 39.5142 | 1.649 |
| 39.5264 | 1.657 |
| 39.5386 | 1.664 |
| 39.5508 | 1.672 |
| 39.563 | 1.68 |
| 39.5752 | 1.688 |
| 39.5874 | 1.696 |
| 39.5996 | 1.704 |
| 39.6118 | 1.712 |
| 39.624 | 1.721 |
| 39.6362 | 1.729 |
| 39.6484 | 1.738 |
| 39.6606 | 1.746 |
| 39.6729 | 1.755 |
| 39.6851 | 1.764 |
| 39.6973 | 1.772 |
| 39.7095 | 1.781 |
| 39.7217 | 1.79 |
| 39.7339 | 1.799 |
| 39.7461 | 1.808 |
| 39.7583 | 1.817 |
| 39.7705 | 1.826 |
| 39.7827 | 1.835 |
| 39.7949 | 1.845 |
| 39.8071 | 1.854 |
| 39.8193 | 1.863 |
| 39.8315 | 1.872 |
| 39.8438 | 1.881 |
| 39.856 | 1.89 |
| 39.8682 | 1.899 |
| 39.8804 | 1.908 |
| 39.8926 | 1.917 |
| 39.9048 | 1.926 |
| 39.917 | 1.935 |
| 39.9292 | 1.944 |
| 39.9414 | 1.953 |
| 39.9536 | 1.961 |
| 39.9658 | 1.97 |
| 39.978 | 1.978 |
| 39.9902 | 1.986 |
| 40.0024 | 1.994 |
| 40.0146 | 2.002 |
| 40.0269 | 2.01 |
| 40.0391 | 2.017 |
| 40.0513 | 2.025 |
| 40.0635 | 2.032 |
| 40.0757 | 2.039 |
| 40.0879 | 2.045 |
| 40.1001 | 2.052 |
| 40.1123 | 2.058 |
| 40.1245 | 2.064 |
| 40.1367 | 2.07 |
| 40.1489 | 2.075 |
| 40.1611 | 2.08 |
| 40.1733 | 2.085 |
| 40.1855 | 2.089 |
| 40.1978 | 2.093 |
| 40.21 | 2.097 |
| 40.2222 | 2.1 |
| 40.2344 | 2.103 |
| 40.2466 | 2.106 |
| 40.2588 | 2.108 |
| 40.271 | 2.11 |
| 40.2832 | 2.111 |
| 40.2954 | 2.112 |
| 40.3076 | 2.113 |
| 40.3198 | 2.113 |
| 40.332 | 2.113 |
| 40.3442 | 2.113 |
| 40.3564 | 2.112 |
| 40.3687 | 2.111 |
| 40.3809 | 2.109 |
| 40.3931 | 2.107 |
| 40.4053 | 2.105 |
| 40.4175 | 2.102 |
| 40.4297 | 2.099 |
| 40.4419 | 2.095 |
| 40.4541 | 2.091 |
| 40.4663 | 2.087 |
| 40.4785 | 2.082 |
| 40.4907 | 2.077 |
| 40.5029 | 2.072 |
| 40.5151 | 2.067 |
| 40.5273 | 2.061 |
| 40.5396 | 2.055 |
| 40.5518 | 2.048 |
| 40.564 | 2.042 |
| 40.5762 | 2.035 |
| 40.5884 | 2.027 |
| 40.6006 | 2.02 |
| 40.6128 | 2.012 |
| 40.625 | 2.004 |
| 40.6372 | 1.996 |
| 40.6494 | 1.988 |
| 40.6616 | 1.98 |
| 40.6738 | 1.971 |
| 40.686 | 1.962 |
| 40.6982 | 1.953 |
| 40.7104 | 1.944 |
| 40.7227 | 1.935 |
| 40.7349 | 1.926 |
| 40.7471 | 1.917 |
| 40.7593 | 1.907 |
| 40.7715 | 1.898 |
| 40.7837 | 1.888 |
| 40.7959 | 1.879 |
| 40.8081 | 1.869 |
| 40.8203 | 1.86 |
| 40.8325 | 1.85 |
| 40.8447 | 1.84 |
| 40.8569 | 1.831 |
| 40.8691 | 1.821 |
| 40.8813 | 1.812 |
| 40.8936 | 1.802 |
| 40.9058 | 1.792 |
| 40.918 | 1.783 |
| 40.9302 | 1.773 |
| 40.9424 | 1.764 |
| 40.9546 | 1.755 |
| 40.9668 | 1.745 |
| 40.979 | 1.736 |
| 40.9912 | 1.727 |
| 41.0034 | 1.718 |
| 41.0156 | 1.709 |
| 41.0278 | 1.7 |
| 41.04 | 1.691 |
| 41.0522 | 1.682 |
| 41.0645 | 1.673 |
| 41.0767 | 1.665 |
| 41.0889 | 1.656 |
| 41.1011 | 1.648 |
| 41.1133 | 1.639 |
| 41.1255 | 1.631 |
| 41.1377 | 1.623 |
| 41.1499 | 1.615 |
| 41.1621 | 1.607 |
| 41.1743 | 1.599 |
| 41.1865 | 1.592 |
| 41.1987 | 1.584 |
| 41.2109 | 1.577 |
| 41.2231 | 1.57 |
| 41.2354 | 1.562 |
| 41.2476 | 1.555 |
| 41.2598 | 1.548 |
| 41.272 | 1.541 |
| 41.2842 | 1.535 |
| 41.2964 | 1.528 |
| 41.3086 | 1.522 |
| 41.3208 | 1.515 |
| 41.333 | 1.509 |
| 41.3452 | 1.503 |
| 41.3574 | 1.497 |
| 41.3696 | 1.491 |
| 41.3818 | 1.485 |
| 41.394 | 1.48 |
| 41.4063 | 1.474 |
| 41.4185 | 1.469 |
| 41.4307 | 1.464 |
| 41.4429 | 1.458 |
| 41.4551 | 1.453 |
| 41.4673 | 1.449 |
| 41.4795 | 1.444 |
| 41.4917 | 1.439 |
| 41.5039 | 1.434 |
| 41.5161 | 1.43 |
| 41.5283 | 1.426 |
| 41.5405 | 1.422 |
| 41.5527 | 1.417 |
| 41.5649 | 1.413 |
| 41.5771 | 1.41 |
| 41.5894 | 1.406 |
| 41.6016 | 1.402 |
| 41.6138 | 1.399 |
| 41.626 | 1.395 |
| 41.6382 | 1.392 |
| 41.6504 | 1.389 |
| 41.6626 | 1.386 |
| 41.6748 | 1.383 |
| 41.687 | 1.38 |
| 41.6992 | 1.377 |
| 41.7114 | 1.375 |
| 41.7236 | 1.372 |
| 41.7358 | 1.37 |
| 41.748 | 1.367 |
| 41.7603 | 1.365 |
| 41.7725 | 1.363 |
| 41.7847 | 1.361 |
| 41.7969 | 1.359 |
| 41.8091 | 1.358 |
| 41.8213 | 1.356 |
| 41.8335 | 1.354 |
| 41.8457 | 1.353 |
| 41.8579 | 1.352 |
| 41.8701 | 1.35 |
| 41.8823 | 1.349 |
| 41.8945 | 1.348 |
| 41.9067 | 1.347 |
| 41.9189 | 1.347 |
| 41.9312 | 1.346 |
| 41.9434 | 1.345 |
| 41.9556 | 1.345 |
| 41.9678 | 1.344 |
| 41.98 | 1.344 |
| 41.9922 | 1.344 |
| 42.0044 | 1.344 |
| 42.0166 | 1.344 |
| 42.0288 | 1.344 |
| 42.041 | 1.344 |
| 42.0532 | 1.345 |
| 42.0654 | 1.345 |
| 42.0776 | 1.346 |
| 42.0898 | 1.346 |
| 42.1021 | 1.347 |
| 42.1143 | 1.348 |
| 42.1265 | 1.349 |
| 42.1387 | 1.35 |
| 42.1509 | 1.351 |
| 42.1631 | 1.352 |
| 42.1753 | 1.354 |
| 42.1875 | 1.355 |
| 42.1997 | 1.357 |
| 42.2119 | 1.358 |
| 42.2241 | 1.36 |
| 42.2363 | 1.362 |
| 42.2485 | 1.364 |
| 42.2607 | 1.366 |
| 42.2729 | 1.368 |
| 42.2852 | 1.371 |
| 42.2974 | 1.373 |
| 42.3096 | 1.376 |
| 42.3218 | 1.378 |
| 42.334 | 1.381 |
| 42.3462 | 1.384 |
| 42.3584 | 1.387 |
| 42.3706 | 1.39 |
| 42.3828 | 1.393 |
| 42.395 | 1.397 |
| 42.4072 | 1.4 |
| 42.4194 | 1.404 |
| 42.4316 | 1.407 |
| 42.4438 | 1.411 |
| 42.4561 | 1.415 |
| 42.4683 | 1.419 |
| 42.4805 | 1.423 |
| 42.4927 | 1.427 |
| 42.5049 | 1.431 |
| 42.5171 | 1.436 |
| 42.5293 | 1.44 |
| 42.5415 | 1.445 |
| 42.5537 | 1.449 |
| 42.5659 | 1.454 |
| 42.5781 | 1.459 |
| 42.5903 | 1.464 |
| 42.6025 | 1.469 |
| 42.6147 | 1.475 |
| 42.6269 | 1.48 |
| 42.6392 | 1.486 |
| 42.6514 | 1.491 |
| 42.6636 | 1.497 |
| 42.6758 | 1.503 |
| 42.688 | 1.509 |
| 42.7002 | 1.515 |
| 42.7124 | 1.521 |
| 42.7246 | 1.527 |
| 42.7368 | 1.534 |
| 42.749 | 1.54 |
| 42.7612 | 1.547 |
| 42.7734 | 1.554 |
| 42.7856 | 1.56 |
| 42.7979 | 1.567 |
| 42.8101 | 1.574 |
| 42.8223 | 1.581 |
| 42.8345 | 1.589 |
| 42.8467 | 1.596 |
| 42.8589 | 1.603 |
| 42.8711 | 1.611 |
| 42.8833 | 1.619 |
| 42.8955 | 1.626 |
| 42.9077 | 1.634 |
| 42.9199 | 1.642 |
| 42.9321 | 1.65 |
| 42.9443 | 1.658 |
| 42.9565 | 1.666 |
| 42.9688 | 1.674 |
| 42.981 | 1.682 |
| 42.9932 | 1.691 |
| 43.0054 | 1.699 |
| 43.0176 | 1.708 |
| 43.0298 | 1.716 |
| 43.042 | 1.725 |
| 43.0542 | 1.733 |
| 43.0664 | 1.742 |
| 43.0786 | 1.75 |
| 43.0908 | 1.759 |
| 43.103 | 1.768 |
| 43.1152 | 1.777 |
| 43.1274 | 1.785 |
| 43.1396 | 1.794 |
| 43.1519 | 1.803 |
| 43.1641 | 1.811 |
| 43.1763 | 1.82 |
| 43.1885 | 1.829 |
| 43.2007 | 1.837 |
| 43.2129 | 1.846 |
| 43.2251 | 1.855 |
| 43.2373 | 1.863 |
| 43.2495 | 1.872 |
| 43.2617 | 1.88 |
| 43.2739 | 1.888 |
| 43.2861 | 1.896 |
| 43.2983 | 1.904 |
| 43.3105 | 1.912 |
| 43.3228 | 1.92 |
| 43.335 | 1.928 |
| 43.3472 | 1.935 |
| 43.3594 | 1.943 |
| 43.3716 | 1.95 |
| 43.3838 | 1.957 |
| 43.396 | 1.964 |
| 43.4082 | 1.97 |
| 43.4204 | 1.977 |
| 43.4326 | 1.983 |
| 43.4448 | 1.989 |
| 43.457 | 1.994 |
| 43.4692 | 2 |
| 43.4814 | 2.005 |
| 43.4937 | 2.01 |
| 43.5059 | 2.015 |
| 43.5181 | 2.019 |
| 43.5303 | 2.023 |
| 43.5425 | 2.027 |
| 43.5547 | 2.03 |
| 43.5669 | 2.034 |
| 43.5791 | 2.036 |
| 43.5913 | 2.039 |
| 43.6035 | 2.041 |
| 43.6157 | 2.043 |
| 43.6279 | 2.044 |
| 43.6401 | 2.046 |
| 43.6523 | 2.047 |
| 43.6646 | 2.047 |
| 43.6768 | 2.047 |
| 43.689 | 2.047 |
| 43.7012 | 2.047 |
| 43.7134 | 2.046 |
| 43.7256 | 2.045 |
| 43.7378 | 2.043 |
| 43.75 | 2.041 |
| 43.7622 | 2.039 |
| 43.7744 | 2.037 |
| 43.7866 | 2.034 |
| 43.7988 | 2.031 |
| 43.811 | 2.028 |
| 43.8232 | 2.024 |
| 43.8354 | 2.02 |
| 43.8477 | 2.016 |
| 43.8599 | 2.011 |
| 43.8721 | 2.007 |
| 43.8843 | 2.002 |
| 43.8965 | 1.996 |
| 43.9087 | 1.991 |
| 43.9209 | 1.985 |
| 43.9331 | 1.979 |
| 43.9453 | 1.973 |
| 43.9575 | 1.967 |
| 43.9697 | 1.961 |
| 43.9819 | 1.954 |
| 43.9941 | 1.947 |
| 44.0063 | 1.94 |
| 44.0186 | 1.933 |
| 44.0308 | 1.926 |
| 44.043 | 1.919 |
| 44.0552 | 1.911 |
| 44.0674 | 1.904 |
| 44.0796 | 1.896 |
| 44.0918 | 1.888 |
| 44.104 | 1.881 |
| 44.1162 | 1.873 |
| 44.1284 | 1.865 |
| 44.1406 | 1.857 |
| 44.1528 | 1.849 |
| 44.165 | 1.841 |
| 44.1772 | 1.833 |
| 44.1894 | 1.825 |
| 44.2017 | 1.817 |
| 44.2139 | 1.809 |
| 44.2261 | 1.801 |
| 44.2383 | 1.793 |
| 44.2505 | 1.785 |
| 44.2627 | 1.777 |
| 44.2749 | 1.769 |
| 44.2871 | 1.761 |
| 44.2993 | 1.753 |
| 44.3115 | 1.745 |
| 44.3237 | 1.737 |
| 44.3359 | 1.73 |
| 44.3481 | 1.722 |
| 44.3603 | 1.715 |
| 44.3726 | 1.707 |
| 44.3848 | 1.7 |
| 44.397 | 1.692 |
| 44.4092 | 1.685 |
| 44.4214 | 1.678 |
| 44.4336 | 1.671 |
| 44.4458 | 1.663 |
| 44.458 | 1.657 |
| 44.4702 | 1.65 |
| 44.4824 | 1.643 |
| 44.4946 | 1.636 |
| 44.5068 | 1.63 |
| 44.519 | 1.623 |
| 44.5313 | 1.617 |
| 44.5435 | 1.61 |
| 44.5557 | 1.604 |
| 44.5679 | 1.598 |
| 44.5801 | 1.592 |
| 44.5923 | 1.586 |
| 44.6045 | 1.581 |
| 44.6167 | 1.575 |
| 44.6289 | 1.569 |
| 44.6411 | 1.564 |
| 44.6533 | 1.559 |
| 44.6655 | 1.553 |
| 44.6777 | 1.548 |
| 44.6899 | 1.543 |
| 44.7021 | 1.538 |
| 44.7144 | 1.534 |
| 44.7266 | 1.529 |
| 44.7388 | 1.524 |
| 44.751 | 1.52 |
| 44.7632 | 1.516 |
| 44.7754 | 1.511 |
| 44.7876 | 1.507 |
| 44.7998 | 1.503 |
| 44.812 | 1.499 |
| 44.8242 | 1.496 |
| 44.8364 | 1.492 |
| 44.8486 | 1.488 |
| 44.8608 | 1.485 |
| 44.873 | 1.482 |
| 44.8853 | 1.478 |
| 44.8975 | 1.475 |
| 44.9097 | 1.472 |
| 44.9219 | 1.469 |
| 44.9341 | 1.467 |
| 44.9463 | 1.464 |
| 44.9585 | 1.461 |
| 44.9707 | 1.459 |
| 44.9829 | 1.457 |
| 44.9951 | 1.454 |
| 45.0073 | 1.452 |
| 45.0195 | 1.45 |
| 45.0317 | 1.448 |
| 45.0439 | 1.447 |
| 45.0562 | 1.445 |
| 45.0684 | 1.443 |
| 45.0806 | 1.442 |
| 45.0928 | 1.441 |
| 45.105 | 1.439 |
| 45.1172 | 1.438 |
| 45.1294 | 1.437 |
| 45.1416 | 1.436 |
| 45.1538 | 1.436 |
| 45.166 | 1.435 |
| 45.1782 | 1.434 |
| 45.1904 | 1.434 |
| 45.2026 | 1.433 |
| 45.2148 | 1.433 |
| 45.2271 | 1.433 |
| 45.2393 | 1.433 |
| 45.2515 | 1.433 |
| 45.2637 | 1.433 |
| 45.2759 | 1.433 |
| 45.2881 | 1.434 |
| 45.3003 | 1.434 |
| 45.3125 | 1.435 |
| 45.3247 | 1.436 |
| 45.3369 | 1.436 |
| 45.3491 | 1.437 |
| 45.3613 | 1.438 |
| 45.3735 | 1.439 |
| 45.3857 | 1.441 |
| 45.3979 | 1.442 |
| 45.4102 | 1.443 |
| 45.4224 | 1.445 |
| 45.4346 | 1.447 |
| 45.4468 | 1.448 |
| 45.459 | 1.45 |
| 45.4712 | 1.452 |
| 45.4834 | 1.454 |
| 45.4956 | 1.457 |
| 45.5078 | 1.459 |
| 45.52 | 1.461 |
| 45.5322 | 1.464 |
| 45.5444 | 1.466 |
| 45.5566 | 1.469 |
| 45.5688 | 1.472 |
| 45.5811 | 1.475 |
| 45.5933 | 1.478 |
| 45.6055 | 1.481 |
| 45.6177 | 1.484 |
| 45.6299 | 1.488 |
| 45.6421 | 1.491 |
| 45.6543 | 1.495 |
| 45.6665 | 1.499 |
| 45.6787 | 1.502 |
| 45.6909 | 1.506 |
| 45.7031 | 1.51 |
| 45.7153 | 1.515 |
| 45.7275 | 1.519 |
| 45.7397 | 1.523 |
| 45.752 | 1.528 |
| 45.7642 | 1.532 |
| 45.7764 | 1.537 |
| 45.7886 | 1.542 |
| 45.8008 | 1.546 |
| 45.813 | 1.551 |
| 45.8252 | 1.556 |
| 45.8374 | 1.562 |
| 45.8496 | 1.567 |
| 45.8618 | 1.572 |
| 45.874 | 1.578 |
| 45.8862 | 1.583 |
| 45.8984 | 1.589 |
| 45.9106 | 1.595 |
| 45.9228 | 1.601 |
| 45.9351 | 1.607 |
| 45.9473 | 1.613 |
| 45.9595 | 1.619 |
| 45.9717 | 1.625 |
| 45.9839 | 1.631 |
| 45.9961 | 1.638 |
| 46.0083 | 1.644 |
| 46.0205 | 1.651 |
| 46.0327 | 1.657 |
| 46.0449 | 1.664 |
| 46.0571 | 1.671 |
| 46.0693 | 1.678 |
| 46.0815 | 1.685 |
| 46.0938 | 1.692 |
| 46.106 | 1.699 |
| 46.1182 | 1.706 |
| 46.1304 | 1.713 |
| 46.1426 | 1.72 |
| 46.1548 | 1.728 |
| 46.167 | 1.735 |
| 46.1792 | 1.742 |
| 46.1914 | 1.75 |
| 46.2036 | 1.757 |
| 46.2158 | 1.765 |
| 46.228 | 1.772 |
| 46.2402 | 1.78 |
| 46.2524 | 1.787 |
| 46.2646 | 1.795 |
| 46.2769 | 1.802 |
| 46.2891 | 1.81 |
| 46.3013 | 1.817 |
| 46.3135 | 1.824 |
| 46.3257 | 1.832 |
| 46.3379 | 1.839 |
| 46.3501 | 1.846 |
| 46.3623 | 1.854 |
| 46.3745 | 1.861 |
| 46.3867 | 1.868 |
| 46.3989 | 1.875 |
| 46.4111 | 1.882 |
| 46.4233 | 1.889 |
| 46.4355 | 1.896 |
| 46.4478 | 1.902 |
| 46.46 | 1.909 |
| 46.4722 | 1.915 |
| 46.4844 | 1.921 |
| 46.4966 | 1.928 |
| 46.5088 | 1.933 |
| 46.521 | 1.939 |
| 46.5332 | 1.945 |
| 46.5454 | 1.95 |
| 46.5576 | 1.956 |
| 46.5698 | 1.961 |
| 46.582 | 1.965 |
| 46.5942 | 1.97 |
| 46.6064 | 1.974 |
| 46.6187 | 1.978 |
| 46.6309 | 1.982 |
| 46.6431 | 1.986 |
| 46.6553 | 1.989 |
| 46.6675 | 1.993 |
| 46.6797 | 1.995 |
| 46.6919 | 1.998 |
| 46.7041 | 2 |
| 46.7163 | 2.002 |
| 46.7285 | 2.004 |
| 46.7407 | 2.006 |
| 46.7529 | 2.007 |
| 46.7651 | 2.008 |
| 46.7773 | 2.008 |
| 46.7896 | 2.009 |
| 46.8018 | 2.009 |
| 46.814 | 2.008 |
| 46.8262 | 2.008 |
| 46.8384 | 2.007 |
| 46.8506 | 2.005 |
| 46.8628 | 2.004 |
| 46.875 | 2.002 |
| 46.8872 | 2 |
| 46.8994 | 1.998 |
| 46.9116 | 1.995 |
| 46.9238 | 1.992 |
| 46.936 | 1.989 |
| 46.9482 | 1.985 |
| 46.9604 | 1.982 |
| 46.9727 | 1.978 |
| 46.9849 | 1.973 |
| 46.9971 | 1.969 |
| 47.0093 | 1.964 |
| 47.0215 | 1.959 |
| 47.0337 | 1.954 |
| 47.0459 | 1.949 |
| 47.0581 | 1.943 |
| 47.0703 | 1.937 |
| 47.0825 | 1.931 |
| 47.0947 | 1.925 |
| 47.1069 | 1.919 |
| 47.1191 | 1.912 |
| 47.1313 | 1.906 |
| 47.1436 | 1.899 |
| 47.1558 | 1.892 |
| 47.168 | 1.885 |
| 47.1802 | 1.878 |
| 47.1924 | 1.871 |
| 47.2046 | 1.864 |
| 47.2168 | 1.856 |
| 47.229 | 1.849 |
| 47.2412 | 1.841 |
| 47.2534 | 1.834 |
| 47.2656 | 1.826 |
| 47.2778 | 1.818 |
| 47.29 | 1.81 |
| 47.3022 | 1.803 |
| 47.3145 | 1.795 |
| 47.3267 | 1.787 |
| 47.3389 | 1.779 |
| 47.3511 | 1.771 |
| 47.3633 | 1.763 |
| 47.3755 | 1.756 |
| 47.3877 | 1.748 |
| 47.3999 | 1.74 |
| 47.4121 | 1.732 |
| 47.4243 | 1.724 |
| 47.4365 | 1.717 |
| 47.4487 | 1.709 |
| 47.4609 | 1.701 |
| 47.4731 | 1.694 |
| 47.4854 | 1.686 |
| 47.4976 | 1.679 |
| 47.5098 | 1.671 |
| 47.522 | 1.664 |
| 47.5342 | 1.656 |
| 47.5464 | 1.649 |
| 47.5586 | 1.642 |
| 47.5708 | 1.635 |
| 47.583 | 1.628 |
| 47.5952 | 1.621 |
| 47.6074 | 1.614 |
| 47.6196 | 1.607 |
| 47.6318 | 1.6 |
| 47.644 | 1.594 |
| 47.6562 | 1.587 |
| 47.6685 | 1.581 |
| 47.6807 | 1.574 |
| 47.6929 | 1.568 |
| 47.7051 | 1.562 |
| 47.7173 | 1.556 |
| 47.7295 | 1.55 |
| 47.7417 | 1.544 |
| 47.7539 | 1.538 |
| 47.7661 | 1.533 |
| 47.7783 | 1.527 |
| 47.7905 | 1.522 |
| 47.8027 | 1.516 |
| 47.8149 | 1.511 |
| 47.8271 | 1.506 |
| 47.8394 | 1.501 |
| 47.8516 | 1.496 |
| 47.8638 | 1.491 |
| 47.876 | 1.486 |
| 47.8882 | 1.481 |
| 47.9004 | 1.477 |
| 47.9126 | 1.472 |
| 47.9248 | 1.468 |
| 47.937 | 1.464 |
| 47.9492 | 1.46 |
| 47.9614 | 1.456 |
| 47.9736 | 1.452 |
| 47.9858 | 1.448 |
| 47.998 | 1.444 |
| 48.0103 | 1.44 |
| 48.0225 | 1.437 |
| 48.0347 | 1.433 |
| 48.0469 | 1.43 |
| 48.0591 | 1.427 |
| 48.0713 | 1.424 |
| 48.0835 | 1.421 |
| 48.0957 | 1.418 |
| 48.1079 | 1.415 |
| 48.1201 | 1.412 |
| 48.1323 | 1.41 |
| 48.1445 | 1.407 |
| 48.1567 | 1.405 |
| 48.1689 | 1.403 |
| 48.1812 | 1.4 |
| 48.1934 | 1.398 |
| 48.2056 | 1.396 |
| 48.2178 | 1.394 |
| 48.23 | 1.393 |
| 48.2422 | 1.391 |
| 48.2544 | 1.389 |
| 48.2666 | 1.388 |
| 48.2788 | 1.386 |
| 48.291 | 1.385 |
| 48.3032 | 1.384 |
| 48.3154 | 1.383 |
| 48.3276 | 1.382 |
| 48.3398 | 1.381 |
| 48.3521 | 1.38 |
| 48.3643 | 1.379 |
| 48.3765 | 1.379 |
| 48.3887 | 1.378 |
| 48.4009 | 1.378 |
| 48.4131 | 1.377 |
| 48.4253 | 1.377 |
| 48.4375 | 1.377 |
| 48.4497 | 1.377 |
| 48.4619 | 1.377 |
| 48.4741 | 1.377 |
| 48.4863 | 1.377 |
| 48.4985 | 1.378 |
| 48.5107 | 1.378 |
| 48.5229 | 1.379 |
| 48.5352 | 1.379 |
| 48.5474 | 1.38 |
| 48.5596 | 1.381 |
| 48.5718 | 1.382 |
| 48.584 | 1.383 |
| 48.5962 | 1.384 |
| 48.6084 | 1.385 |
| 48.6206 | 1.386 |
| 48.6328 | 1.388 |
| 48.645 | 1.389 |
| 48.6572 | 1.391 |
| 48.6694 | 1.392 |
| 48.6816 | 1.394 |
| 48.6938 | 1.396 |
| 48.7061 | 1.398 |
| 48.7183 | 1.4 |
| 48.7305 | 1.402 |
| 48.7427 | 1.404 |
| 48.7549 | 1.406 |
| 48.7671 | 1.409 |
| 48.7793 | 1.411 |
| 48.7915 | 1.414 |
| 48.8037 | 1.417 |
| 48.8159 | 1.419 |
| 48.8281 | 1.422 |
| 48.8403 | 1.425 |
| 48.8525 | 1.428 |
| 48.8647 | 1.431 |
| 48.877 | 1.434 |
| 48.8892 | 1.438 |
| 48.9014 | 1.441 |
| 48.9136 | 1.445 |
| 48.9258 | 1.448 |
| 48.938 | 1.452 |
| 48.9502 | 1.455 |
| 48.9624 | 1.459 |
| 48.9746 | 1.463 |
| 48.9868 | 1.467 |
| 48.999 | 1.471 |
| 49.0112 | 1.475 |
| 49.0234 | 1.479 |
| 49.0356 | 1.484 |
| 49.0479 | 1.488 |
| 49.0601 | 1.493 |
| 49.0723 | 1.497 |
| 49.0845 | 1.502 |
| 49.0967 | 1.506 |
| 49.1089 | 1.511 |
| 49.1211 | 1.516 |
| 49.1333 | 1.521 |
| 49.1455 | 1.526 |
| 49.1577 | 1.531 |
| 49.1699 | 1.536 |
| 49.1821 | 1.541 |
| 49.1943 | 1.546 |
| 49.2065 | 1.551 |
| 49.2187 | 1.556 |
| 49.231 | 1.562 |
| 49.2432 | 1.567 |
| 49.2554 | 1.572 |
| 49.2676 | 1.578 |
| 49.2798 | 1.583 |
| 49.292 | 1.589 |
| 49.3042 | 1.594 |
| 49.3164 | 1.6 |
| 49.3286 | 1.606 |
| 49.3408 | 1.611 |
| 49.353 | 1.617 |
| 49.3652 | 1.622 |
| 49.3774 | 1.628 |
| 49.3896 | 1.634 |
| 49.4019 | 1.639 |
| 49.4141 | 1.645 |
| 49.4263 | 1.651 |
| 49.4385 | 1.656 |
| 49.4507 | 1.662 |
| 49.4629 | 1.667 |
| 49.4751 | 1.673 |
| 49.4873 | 1.678 |
| 49.4995 | 1.684 |
| 49.5117 | 1.689 |
| 49.5239 | 1.694 |
| 49.5361 | 1.7 |
| 49.5483 | 1.705 |
| 49.5605 | 1.71 |
| 49.5728 | 1.715 |
| 49.585 | 1.72 |
| 49.5972 | 1.725 |
| 49.6094 | 1.73 |
| 49.6216 | 1.734 |
| 49.6338 | 1.739 |
| 49.646 | 1.743 |
| 49.6582 | 1.747 |
| 49.6704 | 1.751 |
| 49.6826 | 1.755 |
| 49.6948 | 1.759 |
| 49.707 | 1.763 |
| 49.7192 | 1.767 |
| 49.7314 | 1.77 |
| 49.7437 | 1.773 |
| 49.7559 | 1.776 |
| 49.7681 | 1.779 |
| 49.7803 | 1.782 |
| 49.7925 | 1.784 |
| 49.8047 | 1.786 |
| 49.8169 | 1.788 |
| 49.8291 | 1.79 |
| 49.8413 | 1.792 |
| 49.8535 | 1.793 |
| 49.8657 | 1.795 |
| 49.8779 | 1.796 |
| 49.8901 | 1.796 |
| 49.9023 | 1.797 |
| 49.9146 | 1.797 |
| 49.9268 | 1.797 |
| 49.939 | 1.797 |
| 49.9512 | 1.797 |
| 49.9634 | 1.796 |
| 49.9756 | 1.796 |
| 49.9878 | 1.795 |
| 50.0 | 1.793 |